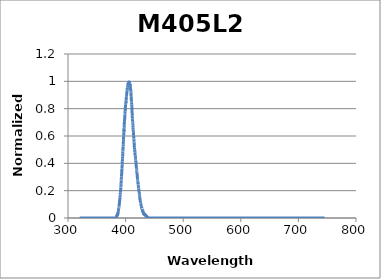
| Category | Normalized Intensity |
|---|---|
| 320.14817633 | 0 |
| 320.25686297 | 0 |
| 320.36555585 | 0 |
| 320.47425497 | 0 |
| 320.58296033 | 0 |
| 320.69167192 | 0 |
| 320.80038974 | 0 |
| 320.9091138 | 0 |
| 321.01784408 | 0 |
| 321.12658059 | 0 |
| 321.23532333 | 0 |
| 321.3440723 | 0 |
| 321.45282748 | 0 |
| 321.56158889 | 0 |
| 321.67035652 | 0 |
| 321.77913037 | 0 |
| 321.88791044 | 0 |
| 321.99669672 | 0 |
| 322.10548922 | 0 |
| 322.21428793 | 0 |
| 322.32309285 | 0 |
| 322.43190398 | 0 |
| 322.54072132 | 0 |
| 322.64954486 | 0 |
| 322.75837461 | 0 |
| 322.86721057 | 0 |
| 322.97605272 | 0 |
| 323.08490108 | 0 |
| 323.19375563 | 0 |
| 323.30261639 | 0 |
| 323.41148333 | 0 |
| 323.52035648 | 0 |
| 323.62923581 | 0 |
| 323.73812134 | 0 |
| 323.84701305 | 0 |
| 323.95591096 | 0 |
| 324.06481505 | 0 |
| 324.17372533 | 0 |
| 324.28264178 | 0 |
| 324.39156443 | 0 |
| 324.50049325 | 0 |
| 324.60942825 | 0 |
| 324.71836943 | 0 |
| 324.82731678 | 0 |
| 324.93627031 | 0 |
| 325.04523001 | 0 |
| 325.15419588 | 0 |
| 325.26316792 | 0 |
| 325.37214613 | 0 |
| 325.48113051 | 0 |
| 325.59012105 | 0 |
| 325.69911775 | 0 |
| 325.80812062 | 0 |
| 325.91712964 | 0 |
| 326.02614483 | 0 |
| 326.13516617 | 0 |
| 326.24419367 | 0 |
| 326.35322732 | 0 |
| 326.46226713 | 0 |
| 326.57131308 | 0 |
| 326.68036519 | 0 |
| 326.78942344 | 0 |
| 326.89848784 | 0 |
| 327.00755839 | 0 |
| 327.11663508 | 0 |
| 327.22571791 | 0 |
| 327.33480688 | 0 |
| 327.44390199 | 0 |
| 327.55300323 | 0 |
| 327.66211061 | 0 |
| 327.77122413 | 0 |
| 327.88034378 | 0 |
| 327.98946956 | 0 |
| 328.09860147 | 0 |
| 328.20773951 | 0 |
| 328.31688367 | 0 |
| 328.42603396 | 0 |
| 328.53519037 | 0 |
| 328.6443529 | 0 |
| 328.75352156 | 0 |
| 328.86269633 | 0 |
| 328.97187722 | 0 |
| 329.08106423 | 0 |
| 329.19025735 | 0 |
| 329.29945658 | 0 |
| 329.40866192 | 0 |
| 329.51787337 | 0 |
| 329.62709093 | 0 |
| 329.7363146 | 0 |
| 329.84554437 | 0 |
| 329.95478025 | 0 |
| 330.06402222 | 0 |
| 330.1732703 | 0 |
| 330.28252448 | 0 |
| 330.39178475 | 0 |
| 330.50105112 | 0 |
| 330.61032358 | 0 |
| 330.71960213 | 0 |
| 330.82888678 | 0 |
| 330.93817751 | 0 |
| 331.04747434 | 0 |
| 331.15677725 | 0 |
| 331.26608624 | 0 |
| 331.37540132 | 0 |
| 331.48472248 | 0 |
| 331.59404972 | 0 |
| 331.70338303 | 0 |
| 331.81272243 | 0 |
| 331.9220679 | 0 |
| 332.03141944 | 0 |
| 332.14077706 | 0 |
| 332.25014075 | 0 |
| 332.3595105 | 0 |
| 332.46888633 | 0 |
| 332.57826822 | 0 |
| 332.68765617 | 0 |
| 332.79705019 | 0 |
| 332.90645027 | 0 |
| 333.01585641 | 0 |
| 333.12526861 | 0 |
| 333.23468687 | 0 |
| 333.34411118 | 0 |
| 333.45354155 | 0 |
| 333.56297796 | 0 |
| 333.67242043 | 0 |
| 333.78186895 | 0 |
| 333.89132352 | 0 |
| 334.00078413 | 0 |
| 334.11025079 | 0 |
| 334.21972349 | 0 |
| 334.32920223 | 0 |
| 334.43868701 | 0 |
| 334.54817783 | 0 |
| 334.65767469 | 0 |
| 334.76717758 | 0 |
| 334.8766865 | 0 |
| 334.98620146 | 0 |
| 335.09572245 | 0 |
| 335.20524947 | 0 |
| 335.31478252 | 0 |
| 335.42432159 | 0 |
| 335.53386669 | 0 |
| 335.64341781 | 0 |
| 335.75297495 | 0 |
| 335.86253811 | 0 |
| 335.97210729 | 0 |
| 336.08168249 | 0 |
| 336.1912637 | 0 |
| 336.30085093 | 0 |
| 336.41044416 | 0 |
| 336.52004341 | 0 |
| 336.62964867 | 0 |
| 336.73925994 | 0 |
| 336.84887721 | 0 |
| 336.95850049 | 0 |
| 337.06812977 | 0 |
| 337.17776505 | 0 |
| 337.28740633 | 0 |
| 337.39705361 | 0 |
| 337.50670688 | 0 |
| 337.61636616 | 0 |
| 337.72603142 | 0 |
| 337.83570268 | 0 |
| 337.94537993 | 0 |
| 338.05506317 | 0 |
| 338.16475239 | 0 |
| 338.2744476 | 0 |
| 338.3841488 | 0 |
| 338.49385598 | 0 |
| 338.60356914 | 0 |
| 338.71328828 | 0 |
| 338.8230134 | 0 |
| 338.93274449 | 0 |
| 339.04248156 | 0 |
| 339.15222461 | 0 |
| 339.26197362 | 0 |
| 339.37172861 | 0 |
| 339.48148957 | 0 |
| 339.59125649 | 0 |
| 339.70102938 | 0 |
| 339.81080823 | 0 |
| 339.92059305 | 0 |
| 340.03038383 | 0 |
| 340.14018057 | 0 |
| 340.24998327 | 0 |
| 340.35979192 | 0 |
| 340.46960653 | 0 |
| 340.57942709 | 0 |
| 340.6892536 | 0 |
| 340.79908607 | 0 |
| 340.90892448 | 0 |
| 341.01876885 | 0 |
| 341.12861915 | 0 |
| 341.2384754 | 0 |
| 341.3483376 | 0 |
| 341.45820574 | 0 |
| 341.56807981 | 0 |
| 341.67795983 | 0 |
| 341.78784578 | 0 |
| 341.89773766 | 0 |
| 342.00763548 | 0 |
| 342.11753924 | 0 |
| 342.22744892 | 0 |
| 342.33736453 | 0 |
| 342.44728607 | 0 |
| 342.55721353 | 0 |
| 342.66714692 | 0 |
| 342.77708623 | 0 |
| 342.88703147 | 0 |
| 342.99698262 | 0 |
| 343.10693969 | 0 |
| 343.21690268 | 0 |
| 343.32687158 | 0 |
| 343.4368464 | 0 |
| 343.54682713 | 0 |
| 343.65681377 | 0 |
| 343.76680631 | 0 |
| 343.87680477 | 0 |
| 343.98680913 | 0 |
| 344.0968194 | 0 |
| 344.20683557 | 0 |
| 344.31685763 | 0 |
| 344.4268856 | 0 |
| 344.53691947 | 0 |
| 344.64695924 | 0 |
| 344.75700489 | 0 |
| 344.86705645 | 0 |
| 344.97711389 | 0 |
| 345.08717723 | 0 |
| 345.19724645 | 0 |
| 345.30732156 | 0 |
| 345.41740256 | 0 |
| 345.52748944 | 0 |
| 345.63758221 | 0 |
| 345.74768085 | 0 |
| 345.85778538 | 0 |
| 345.96789578 | 0 |
| 346.07801206 | 0 |
| 346.18813421 | 0 |
| 346.29826224 | 0 |
| 346.40839614 | 0 |
| 346.51853591 | 0 |
| 346.62868155 | 0 |
| 346.73883306 | 0 |
| 346.84899043 | 0 |
| 346.95915367 | 0 |
| 347.06932277 | 0 |
| 347.17949773 | 0 |
| 347.28967855 | 0 |
| 347.39986522 | 0 |
| 347.51005776 | 0 |
| 347.62025615 | 0 |
| 347.73046039 | 0 |
| 347.84067049 | 0 |
| 347.95088643 | 0 |
| 348.06110823 | 0 |
| 348.17133587 | 0 |
| 348.28156935 | 0 |
| 348.39180868 | 0 |
| 348.50205386 | 0 |
| 348.61230487 | 0 |
| 348.72256173 | 0 |
| 348.83282442 | 0 |
| 348.94309295 | 0 |
| 349.05336731 | 0 |
| 349.16364751 | 0 |
| 349.27393354 | 0 |
| 349.3842254 | 0 |
| 349.49452309 | 0 |
| 349.6048266 | 0 |
| 349.71513594 | 0 |
| 349.82545111 | 0 |
| 349.93577209 | 0 |
| 350.0460989 | 0 |
| 350.15643153 | 0 |
| 350.26676998 | 0 |
| 350.37711424 | 0 |
| 350.48746432 | 0 |
| 350.59782021 | 0 |
| 350.70818191 | 0 |
| 350.81854942 | 0 |
| 350.92892274 | 0 |
| 351.03930187 | 0 |
| 351.14968681 | 0 |
| 351.26007754 | 0 |
| 351.37047409 | 0 |
| 351.48087643 | 0 |
| 351.59128457 | 0 |
| 351.70169851 | 0 |
| 351.81211824 | 0 |
| 351.92254377 | 0 |
| 352.0329751 | 0 |
| 352.14341221 | 0 |
| 352.25385512 | 0 |
| 352.36430381 | 0 |
| 352.47475829 | 0 |
| 352.58521856 | 0 |
| 352.69568461 | 0 |
| 352.80615644 | 0 |
| 352.91663406 | 0 |
| 353.02711745 | 0 |
| 353.13760662 | 0 |
| 353.24810157 | 0 |
| 353.35860229 | 0 |
| 353.46910879 | 0 |
| 353.57962106 | 0 |
| 353.69013909 | 0 |
| 353.8006629 | 0 |
| 353.91119247 | 0 |
| 354.02172781 | 0 |
| 354.13226891 | 0 |
| 354.24281578 | 0 |
| 354.3533684 | 0 |
| 354.46392679 | 0 |
| 354.57449093 | 0 |
| 354.68506083 | 0 |
| 354.79563649 | 0 |
| 354.90621789 | 0 |
| 355.01680505 | 0 |
| 355.12739796 | 0 |
| 355.23799662 | 0 |
| 355.34860102 | 0 |
| 355.45921117 | 0 |
| 355.56982707 | 0 |
| 355.6804487 | 0 |
| 355.79107608 | 0 |
| 355.9017092 | 0 |
| 356.01234805 | 0 |
| 356.12299264 | 0 |
| 356.23364297 | 0 |
| 356.34429902 | 0 |
| 356.45496081 | 0 |
| 356.56562833 | 0 |
| 356.67630158 | 0 |
| 356.78698056 | 0 |
| 356.89766526 | 0 |
| 357.00835568 | 0 |
| 357.11905183 | 0 |
| 357.2297537 | 0 |
| 357.34046128 | 0 |
| 357.45117459 | 0 |
| 357.56189361 | 0 |
| 357.67261835 | 0 |
| 357.78334879 | 0 |
| 357.89408495 | 0 |
| 358.00482682 | 0 |
| 358.1155744 | 0 |
| 358.22632769 | 0 |
| 358.33708668 | 0 |
| 358.44785137 | 0 |
| 358.55862177 | 0 |
| 358.66939787 | 0 |
| 358.78017966 | 0 |
| 358.89096716 | 0 |
| 359.00176035 | 0 |
| 359.11255923 | 0 |
| 359.22336381 | 0 |
| 359.33417408 | 0 |
| 359.44499004 | 0 |
| 359.55581169 | 0 |
| 359.66663902 | 0 |
| 359.77747204 | 0 |
| 359.88831075 | 0 |
| 359.99915513 | 0 |
| 360.1100052 | 0 |
| 360.22086094 | 0 |
| 360.33172237 | 0 |
| 360.44258947 | 0 |
| 360.55346224 | 0 |
| 360.66434069 | 0 |
| 360.77522481 | 0 |
| 360.8861146 | 0 |
| 360.99701005 | 0 |
| 361.10791118 | 0 |
| 361.21881796 | 0 |
| 361.32973042 | 0 |
| 361.44064853 | 0 |
| 361.55157231 | 0 |
| 361.66250174 | 0 |
| 361.77343683 | 0 |
| 361.88437758 | 0 |
| 361.99532398 | 0 |
| 362.10627604 | 0 |
| 362.21723374 | 0 |
| 362.3281971 | 0 |
| 362.43916611 | 0 |
| 362.55014076 | 0 |
| 362.66112105 | 0 |
| 362.77210699 | 0 |
| 362.88309858 | 0 |
| 362.9940958 | 0 |
| 363.10509866 | 0 |
| 363.21610716 | 0 |
| 363.3271213 | 0 |
| 363.43814107 | 0 |
| 363.54916647 | 0 |
| 363.6601975 | 0 |
| 363.77123417 | 0 |
| 363.88227646 | 0 |
| 363.99332438 | 0 |
| 364.10437792 | 0 |
| 364.21543709 | 0 |
| 364.32650188 | 0 |
| 364.43757229 | 0 |
| 364.54864832 | 0 |
| 364.65972997 | 0 |
| 364.77081723 | 0 |
| 364.88191011 | 0 |
| 364.9930086 | 0 |
| 365.1041127 | 0 |
| 365.21522241 | 0 |
| 365.32633773 | 0 |
| 365.43745866 | 0 |
| 365.54858519 | 0 |
| 365.65971732 | 0 |
| 365.77085506 | 0 |
| 365.88199839 | 0 |
| 365.99314733 | 0 |
| 366.10430186 | 0 |
| 366.21546199 | 0 |
| 366.32662772 | 0 |
| 366.43779903 | 0 |
| 366.54897594 | 0 |
| 366.66015844 | 0 |
| 366.77134652 | 0 |
| 366.88254019 | 0 |
| 366.99373945 | 0 |
| 367.10494429 | 0 |
| 367.21615471 | 0 |
| 367.32737072 | 0 |
| 367.4385923 | 0 |
| 367.54981946 | 0 |
| 367.66105219 | 0 |
| 367.7722905 | 0 |
| 367.88353438 | 0 |
| 367.99478384 | 0 |
| 368.10603886 | 0 |
| 368.21729945 | 0 |
| 368.32856561 | 0 |
| 368.43983733 | 0 |
| 368.55111462 | 0 |
| 368.66239746 | 0 |
| 368.77368587 | 0 |
| 368.88497984 | 0 |
| 368.99627936 | 0 |
| 369.10758444 | 0 |
| 369.21889508 | 0 |
| 369.33021127 | 0 |
| 369.441533 | 0 |
| 369.55286029 | 0 |
| 369.66419313 | 0 |
| 369.77553151 | 0 |
| 369.88687544 | 0 |
| 369.99822491 | 0 |
| 370.10957992 | 0 |
| 370.22094047 | 0 |
| 370.33230656 | 0 |
| 370.44367819 | 0 |
| 370.55505536 | 0 |
| 370.66643806 | 0 |
| 370.77782629 | 0 |
| 370.88922005 | 0 |
| 371.00061934 | 0 |
| 371.11202416 | 0 |
| 371.22343451 | 0 |
| 371.33485038 | 0 |
| 371.44627178 | 0 |
| 371.55769869 | 0 |
| 371.66913113 | 0 |
| 371.78056908 | 0 |
| 371.89201256 | 0 |
| 372.00346155 | 0 |
| 372.11491605 | 0 |
| 372.22637606 | 0 |
| 372.33784159 | 0 |
| 372.44931262 | 0 |
| 372.56078917 | 0 |
| 372.67227122 | 0 |
| 372.78375877 | 0 |
| 372.89525183 | 0 |
| 373.00675039 | 0 |
| 373.11825445 | 0 |
| 373.22976401 | 0 |
| 373.34127907 | 0 |
| 373.45279962 | 0 |
| 373.56432566 | 0 |
| 373.6758572 | 0 |
| 373.78739423 | 0 |
| 373.89893675 | 0 |
| 374.01048476 | 0 |
| 374.12203825 | 0 |
| 374.23359723 | 0 |
| 374.34516169 | 0 |
| 374.45673163 | 0 |
| 374.56830705 | 0 |
| 374.67988796 | 0 |
| 374.79147433 | 0 |
| 374.90306619 | 0 |
| 375.01466352 | 0 |
| 375.12626632 | 0 |
| 375.23787459 | 0 |
| 375.34948833 | 0 |
| 375.46110754 | 0 |
| 375.57273221 | 0 |
| 375.68436235 | 0 |
| 375.79599796 | 0 |
| 375.90763902 | 0 |
| 376.01928555 | 0 |
| 376.13093753 | 0 |
| 376.24259497 | 0 |
| 376.35425787 | 0 |
| 376.46592622 | 0 |
| 376.57760002 | 0 |
| 376.68927927 | 0 |
| 376.80096397 | 0 |
| 376.91265413 | 0 |
| 377.02434972 | 0 |
| 377.13605076 | 0 |
| 377.24775725 | 0 |
| 377.35946917 | 0 |
| 377.47118654 | 0 |
| 377.58290935 | 0 |
| 377.69463759 | 0 |
| 377.80637126 | 0 |
| 377.91811038 | 0 |
| 378.02985492 | 0 |
| 378.14160489 | 0 |
| 378.2533603 | 0 |
| 378.36512113 | 0 |
| 378.47688739 | 0 |
| 378.58865907 | 0 |
| 378.70043617 | 0 |
| 378.8122187 | 0 |
| 378.92400665 | 0 |
| 379.03580001 | 0 |
| 379.1475988 | 0 |
| 379.25940299 | 0 |
| 379.37121261 | 0 |
| 379.48302763 | 0 |
| 379.59484806 | 0 |
| 379.70667391 | 0 |
| 379.81850516 | 0 |
| 379.93034182 | 0 |
| 380.04218388 | 0 |
| 380.15403135 | 0 |
| 380.26588421 | 0 |
| 380.37774248 | 0 |
| 380.48960615 | 0 |
| 380.60147521 | 0 |
| 380.71334967 | 0 |
| 380.82522952 | 0 |
| 380.93711476 | 0 |
| 381.0490054 | 0 |
| 381.16090142 | 0 |
| 381.27280283 | 0 |
| 381.38470963 | 0 |
| 381.49662181 | 0 |
| 381.60853938 | 0 |
| 381.72046232 | 0 |
| 381.83239065 | 0 |
| 381.94432436 | 0 |
| 382.05626344 | 0 |
| 382.16820789 | 0 |
| 382.28015772 | 0 |
| 382.39211293 | 0 |
| 382.5040735 | 0 |
| 382.61603944 | 0 |
| 382.72801076 | 0 |
| 382.83998743 | 0 |
| 382.95196947 | 0 |
| 383.06395688 | 0 |
| 383.17594964 | 0 |
| 383.28794777 | 0 |
| 383.39995125 | 0 |
| 383.51196009 | 0.003 |
| 383.62397429 | 0.002 |
| 383.73599384 | 0.003 |
| 383.84801874 | 0.002 |
| 383.96004899 | 0.003 |
| 384.07208459 | 0.004 |
| 384.18412554 | 0.006 |
| 384.29617184 | 0.006 |
| 384.40822348 | 0.007 |
| 384.52028046 | 0.009 |
| 384.63234278 | 0.013 |
| 384.74441044 | 0.011 |
| 384.85648345 | 0.014 |
| 384.96856178 | 0.018 |
| 385.08064546 | 0.022 |
| 385.19273447 | 0.018 |
| 385.30482881 | 0.022 |
| 385.41692848 | 0.023 |
| 385.52903347 | 0.021 |
| 385.6411438 | 0.025 |
| 385.75325945 | 0.021 |
| 385.86538043 | 0.025 |
| 385.97750673 | 0.026 |
| 386.08963835 | 0.022 |
| 386.20177529 | 0.024 |
| 386.31391755 | 0.026 |
| 386.42606513 | 0.034 |
| 386.53821802 | 0.028 |
| 386.65037622 | 0.036 |
| 386.76253974 | 0.044 |
| 386.87470857 | 0.046 |
| 386.9868827 | 0.046 |
| 387.09906215 | 0.046 |
| 387.2112469 | 0.044 |
| 387.32343695 | 0.051 |
| 387.43563231 | 0.05 |
| 387.54783297 | 0.056 |
| 387.66003892 | 0.057 |
| 387.77225018 | 0.066 |
| 387.88446673 | 0.066 |
| 387.99668858 | 0.071 |
| 388.10891572 | 0.07 |
| 388.22114815 | 0.076 |
| 388.33338588 | 0.076 |
| 388.44562889 | 0.084 |
| 388.55787719 | 0.084 |
| 388.67013078 | 0.089 |
| 388.78238965 | 0.091 |
| 388.8946538 | 0.097 |
| 389.00692323 | 0.101 |
| 389.11919795 | 0.106 |
| 389.23147794 | 0.108 |
| 389.34376321 | 0.111 |
| 389.45605375 | 0.115 |
| 389.56834957 | 0.122 |
| 389.68065066 | 0.126 |
| 389.79295702 | 0.128 |
| 389.90526865 | 0.135 |
| 390.01758554 | 0.139 |
| 390.1299077 | 0.144 |
| 390.24223513 | 0.151 |
| 390.35456782 | 0.152 |
| 390.46690577 | 0.161 |
| 390.57924898 | 0.163 |
| 390.69159745 | 0.17 |
| 390.80395117 | 0.172 |
| 390.91631015 | 0.182 |
| 391.02867438 | 0.187 |
| 391.14104387 | 0.193 |
| 391.2534186 | 0.196 |
| 391.36579858 | 0.204 |
| 391.47818382 | 0.211 |
| 391.59057429 | 0.222 |
| 391.70297001 | 0.224 |
| 391.81537098 | 0.232 |
| 391.92777718 | 0.239 |
| 392.04018863 | 0.242 |
| 392.15260531 | 0.254 |
| 392.26502723 | 0.264 |
| 392.37745438 | 0.272 |
| 392.48988677 | 0.275 |
| 392.60232439 | 0.282 |
| 392.71476724 | 0.297 |
| 392.82721532 | 0.295 |
| 392.93966862 | 0.304 |
| 393.05212715 | 0.313 |
| 393.16459091 | 0.326 |
| 393.27705989 | 0.332 |
| 393.38953408 | 0.34 |
| 393.5020135 | 0.35 |
| 393.61449814 | 0.359 |
| 393.72698799 | 0.362 |
| 393.83948306 | 0.373 |
| 393.95198334 | 0.38 |
| 394.06448883 | 0.394 |
| 394.17699954 | 0.398 |
| 394.28951545 | 0.414 |
| 394.40203657 | 0.418 |
| 394.51456289 | 0.431 |
| 394.62709442 | 0.433 |
| 394.73963116 | 0.448 |
| 394.85217309 | 0.451 |
| 394.96472022 | 0.47 |
| 395.07727255 | 0.475 |
| 395.18983008 | 0.487 |
| 395.3023928 | 0.492 |
| 395.41496071 | 0.502 |
| 395.52753382 | 0.499 |
| 395.64011212 | 0.52 |
| 395.7526956 | 0.523 |
| 395.86528427 | 0.525 |
| 395.97787813 | 0.537 |
| 396.09047717 | 0.548 |
| 396.2030814 | 0.562 |
| 396.3156908 | 0.57 |
| 396.42830539 | 0.577 |
| 396.54092515 | 0.596 |
| 396.65355009 | 0.596 |
| 396.76618021 | 0.603 |
| 396.87881549 | 0.604 |
| 396.99145595 | 0.624 |
| 397.10410158 | 0.63 |
| 397.21675238 | 0.645 |
| 397.32940834 | 0.639 |
| 397.44206947 | 0.657 |
| 397.55473577 | 0.663 |
| 397.66740723 | 0.675 |
| 397.78008384 | 0.681 |
| 397.89276562 | 0.7 |
| 398.00545256 | 0.697 |
| 398.11814465 | 0.709 |
| 398.23084189 | 0.715 |
| 398.34354429 | 0.723 |
| 398.45625184 | 0.731 |
| 398.56896455 | 0.743 |
| 398.6816824 | 0.74 |
| 398.79440539 | 0.757 |
| 398.90713353 | 0.767 |
| 399.01986682 | 0.777 |
| 399.13260525 | 0.781 |
| 399.24534882 | 0.781 |
| 399.35809753 | 0.793 |
| 399.47085137 | 0.791 |
| 399.58361036 | 0.804 |
| 399.69637448 | 0.812 |
| 399.80914373 | 0.812 |
| 399.92191811 | 0.819 |
| 400.03469762 | 0.826 |
| 400.14748226 | 0.829 |
| 400.26027203 | 0.839 |
| 400.37306692 | 0.842 |
| 400.48586694 | 0.84 |
| 400.59867208 | 0.849 |
| 400.71148234 | 0.848 |
| 400.82429772 | 0.858 |
| 400.93711822 | 0.864 |
| 401.04994383 | 0.871 |
| 401.16277456 | 0.878 |
| 401.2756104 | 0.887 |
| 401.38845136 | 0.887 |
| 401.50129742 | 0.887 |
| 401.61414859 | 0.894 |
| 401.72700487 | 0.898 |
| 401.83986625 | 0.906 |
| 401.95273274 | 0.91 |
| 402.06560433 | 0.913 |
| 402.17848102 | 0.919 |
| 402.29136281 | 0.921 |
| 402.4042497 | 0.925 |
| 402.51714169 | 0.927 |
| 402.63003876 | 0.933 |
| 402.74294094 | 0.933 |
| 402.8558482 | 0.936 |
| 402.96876055 | 0.948 |
| 403.08167799 | 0.945 |
| 403.19460052 | 0.946 |
| 403.30752814 | 0.954 |
| 403.42046083 | 0.954 |
| 403.53339861 | 0.958 |
| 403.64634147 | 0.964 |
| 403.75928941 | 0.966 |
| 403.87224243000003 | 0.963 |
| 403.98520053 | 0.964 |
| 404.09816369 | 0.967 |
| 404.21113193 | 0.971 |
| 404.32410525 | 0.984 |
| 404.43708363 | 0.979 |
| 404.55006708 | 0.973 |
| 404.6630556 | 0.98 |
| 404.77604918 | 0.984 |
| 404.88904783 | 0.984 |
| 405.00205154 | 0.983 |
| 405.11506031 | 0.995 |
| 405.22807414 | 0.985 |
| 405.34109302 | 0.99 |
| 405.45411697 | 0.999 |
| 405.56714596 | 0.999 |
| 405.68018001 | 1 |
| 405.79321911 | 0.992 |
| 405.90626326 | 0.994 |
| 406.01931246 | 0.996 |
| 406.13236671 | 0.994 |
| 406.245426 | 0.994 |
| 406.35849034 | 0.991 |
| 406.47155972 | 0.994 |
| 406.58463413 | 0.993 |
| 406.69771359 | 0.995 |
| 406.81079809 | 0.992 |
| 406.92388762 | 0.986 |
| 407.03698218 | 0.984 |
| 407.15008178 | 0.983 |
| 407.26318641 | 0.981 |
| 407.37629607 | 0.983 |
| 407.48941076 | 0.974 |
| 407.60253047 | 0.982 |
| 407.71565521 | 0.97 |
| 407.82878497 | 0.974 |
| 407.94191976 | 0.965 |
| 408.05505956 | 0.961 |
| 408.16820439 | 0.96 |
| 408.28135423 | 0.955 |
| 408.39450909 | 0.951 |
| 408.50766896 | 0.947 |
| 408.62083385 | 0.938 |
| 408.73400375 | 0.941 |
| 408.84717865 | 0.93 |
| 408.96035857 | 0.933 |
| 409.07354349 | 0.926 |
| 409.18673342 | 0.925 |
| 409.29992835 | 0.917 |
| 409.41312828 | 0.909 |
| 409.52633321 | 0.901 |
| 409.63954314 | 0.888 |
| 409.75275807 | 0.868 |
| 409.865978 | 0.87 |
| 409.97920292 | 0.865 |
| 410.09243283 | 0.867 |
| 410.20566773 | 0.856 |
| 410.31890763 | 0.855 |
| 410.43215251 | 0.843 |
| 410.54540238 | 0.832 |
| 410.65865723 | 0.828 |
| 410.77191707 | 0.818 |
| 410.88518189 | 0.811 |
| 410.99845169 | 0.799 |
| 411.11172647 | 0.789 |
| 411.22500622 | 0.783 |
| 411.33829095 | 0.768 |
| 411.45158066 | 0.76 |
| 411.56487534 | 0.747 |
| 411.67817499 | 0.746 |
| 411.79147961 | 0.73 |
| 411.9047892 | 0.727 |
| 412.01810375 | 0.721 |
| 412.13142327 | 0.718 |
| 412.24474775 | 0.705 |
| 412.3580772 | 0.701 |
| 412.4714116 | 0.696 |
| 412.58475097 | 0.692 |
| 412.69809529 | 0.678 |
| 412.81144456 | 0.674 |
| 412.9247988 | 0.662 |
| 413.03815798 | 0.652 |
| 413.15152212 | 0.648 |
| 413.2648912 | 0.641 |
| 413.37826523 | 0.631 |
| 413.49164421 | 0.629 |
| 413.60502814 | 0.621 |
| 413.71841701 | 0.621 |
| 413.83181082 | 0.604 |
| 413.94520957 | 0.599 |
| 414.05861326 | 0.586 |
| 414.17202188 | 0.582 |
| 414.28543545 | 0.578 |
| 414.39885394 | 0.574 |
| 414.51227737 | 0.562 |
| 414.62570573 | 0.553 |
| 414.73913902 | 0.551 |
| 414.85257724 | 0.546 |
| 414.96602038 | 0.537 |
| 415.07946845 | 0.531 |
| 415.19292145 | 0.522 |
| 415.30637936 | 0.516 |
| 415.4198422 | 0.513 |
| 415.53330995 | 0.504 |
| 415.64678262 | 0.505 |
| 415.76026021 | 0.5 |
| 415.87374271 | 0.486 |
| 415.98723012 | 0.484 |
| 416.10072245 | 0.487 |
| 416.21421968 | 0.48 |
| 416.32772182 | 0.472 |
| 416.44122887 | 0.468 |
| 416.55474082 | 0.457 |
| 416.66825768 | 0.458 |
| 416.78177944 | 0.452 |
| 416.8953061 | 0.45 |
| 417.00883765 | 0.446 |
| 417.12237411 | 0.442 |
| 417.23591546 | 0.437 |
| 417.3494617 | 0.426 |
| 417.46301284 | 0.421 |
| 417.57656887 | 0.42 |
| 417.69012979 | 0.409 |
| 417.80369559 | 0.412 |
| 417.91726628 | 0.409 |
| 418.03084186 | 0.403 |
| 418.14442232 | 0.395 |
| 418.25800766 | 0.391 |
| 418.37159788 | 0.388 |
| 418.48519298 | 0.383 |
| 418.59879296 | 0.377 |
| 418.71239782 | 0.37 |
| 418.82600754 | 0.364 |
| 418.93962214 | 0.365 |
| 419.05324161 | 0.355 |
| 419.16686595 | 0.354 |
| 419.28049516 | 0.346 |
| 419.39412924 | 0.342 |
| 419.50776818 | 0.339 |
| 419.62141198 | 0.339 |
| 419.73506064 | 0.331 |
| 419.84871417 | 0.324 |
| 419.96237255 | 0.32 |
| 420.07603579 | 0.319 |
| 420.18970389 | 0.312 |
| 420.30337684 | 0.308 |
| 420.41705464 | 0.299 |
| 420.53073729 | 0.294 |
| 420.6444248 | 0.288 |
| 420.75811715 | 0.291 |
| 420.87181434 | 0.28 |
| 420.98551638 | 0.28 |
| 421.09922327 | 0.273 |
| 421.212935 | 0.273 |
| 421.32665156 | 0.265 |
| 421.44037297 | 0.262 |
| 421.55409921 | 0.254 |
| 421.66783029 | 0.257 |
| 421.7815662 | 0.246 |
| 421.89530694 | 0.245 |
| 422.00905252 | 0.235 |
| 422.12280292 | 0.236 |
| 422.23655815 | 0.232 |
| 422.35031821 | 0.228 |
| 422.46408309 | 0.221 |
| 422.5778528 | 0.222 |
| 422.69162733 | 0.215 |
| 422.80540667 | 0.211 |
| 422.91919084 | 0.205 |
| 423.03297982 | 0.201 |
| 423.14677362 | 0.196 |
| 423.26057223 | 0.194 |
| 423.37437566 | 0.191 |
| 423.4881839 | 0.189 |
| 423.60199694 | 0.182 |
| 423.71581479 | 0.179 |
| 423.82963745 | 0.177 |
| 423.94346492 | 0.174 |
| 424.05729718 | 0.165 |
| 424.17113425 | 0.161 |
| 424.28497612 | 0.159 |
| 424.39882279 | 0.159 |
| 424.51267425 | 0.152 |
| 424.62653051 | 0.15 |
| 424.74039156 | 0.144 |
| 424.85425741 | 0.142 |
| 424.96812804 | 0.14 |
| 425.08200347 | 0.137 |
| 425.19588368 | 0.133 |
| 425.30976868 | 0.132 |
| 425.42365846 | 0.125 |
| 425.53755303 | 0.124 |
| 425.65145238 | 0.119 |
| 425.76535651 | 0.117 |
| 425.87926541 | 0.112 |
| 425.9931791 | 0.113 |
| 426.10709756 | 0.108 |
| 426.22102079 | 0.107 |
| 426.33494879 | 0.104 |
| 426.44888157 | 0.103 |
| 426.56281911 | 0.099 |
| 426.67676143 | 0.098 |
| 426.7907085 | 0.093 |
| 426.90466035 | 0.094 |
| 427.01861695 | 0.089 |
| 427.13257832 | 0.09 |
| 427.24654445 | 0.085 |
| 427.36051534 | 0.085 |
| 427.47449098 | 0.083 |
| 427.58847138 | 0.085 |
| 427.70245653 | 0.081 |
| 427.81644643 | 0.079 |
| 427.93044109 | 0.072 |
| 428.04444049 | 0.074 |
| 428.15844464 | 0.071 |
| 428.27245354 | 0.072 |
| 428.38646718 | 0.069 |
| 428.50048557 | 0.068 |
| 428.61450869 | 0.065 |
| 428.72853656 | 0.064 |
| 428.84256916 | 0.062 |
| 428.9566065 | 0.063 |
| 429.07064858 | 0.059 |
| 429.18469539 | 0.056 |
| 429.29874693 | 0.054 |
| 429.41280321 | 0.055 |
| 429.52686421 | 0.053 |
| 429.64092994 | 0.05 |
| 429.75500039 | 0.045 |
| 429.86907557 | 0.048 |
| 429.98315548 | 0.044 |
| 430.0972401 | 0.047 |
| 430.21132944 | 0.044 |
| 430.32542351 | 0.045 |
| 430.43952229 | 0.045 |
| 430.55362578 | 0.045 |
| 430.66773399 | 0.047 |
| 430.78184691 | 0.046 |
| 430.89596454 | 0.037 |
| 431.01008688 | 0.036 |
| 431.12421393 | 0.035 |
| 431.23834568 | 0.032 |
| 431.35248214 | 0.035 |
| 431.4666233 | 0.031 |
| 431.58076916 | 0.039 |
| 431.69491972 | 0.031 |
| 431.80907498 | 0.033 |
| 431.92323494 | 0.024 |
| 432.03739959 | 0.031 |
| 432.15156893 | 0.024 |
| 432.26574297 | 0.026 |
| 432.3799217 | 0.021 |
| 432.49410511 | 0.023 |
| 432.60829322 | 0.025 |
| 432.72248601 | 0.026 |
| 432.83668348 | 0.023 |
| 432.95088564 | 0.026 |
| 433.06509248 | 0.026 |
| 433.179304 | 0.022 |
| 433.29352019 | 0.025 |
| 433.40774107 | 0.022 |
| 433.52196661 | 0.024 |
| 433.63619684 | 0.021 |
| 433.75043173 | 0.024 |
| 433.86467129 | 0.021 |
| 433.97891553 | 0.024 |
| 434.09316443 | 0.021 |
| 434.20741799 | 0.024 |
| 434.32167622 | 0.023 |
| 434.43593912 | 0.022 |
| 434.55020667 | 0.021 |
| 434.66447889 | 0.02 |
| 434.77875576 | 0.021 |
| 434.89303729 | 0.017 |
| 435.00732347 | 0.018 |
| 435.12161431 | 0.018 |
| 435.2359098 | 0.017 |
| 435.35020994 | 0.013 |
| 435.46451473 | 0.018 |
| 435.57882416 | 0.013 |
| 435.69313824 | 0.013 |
| 435.80745697 | 0.013 |
| 435.92178034 | 0.013 |
| 436.03610835 | 0.012 |
| 436.150441 | 0.013 |
| 436.26477829 | 0.01 |
| 436.37912021 | 0.012 |
| 436.49346677 | 0.008 |
| 436.60781796 | 0.01 |
| 436.72217379 | 0.009 |
| 436.83653424 | 0.012 |
| 436.95089932 | 0.007 |
| 437.06526904 | 0.01 |
| 437.17964337 | 0.007 |
| 437.29402233 | 0.007 |
| 437.40840592 | 0.006 |
| 437.52279412 | 0.008 |
| 437.63718695 | 0.006 |
| 437.75158439 | 0.005 |
| 437.86598645 | 0.004 |
| 437.98039312 | 0.007 |
| 438.09480441 | 0.003 |
| 438.20922031 | 0.002 |
| 438.32364082 | 0.002 |
| 438.43806593 | 0.005 |
| 438.55249566 | 0.002 |
| 438.66692999 | 0.003 |
| 438.78136893 | 0 |
| 438.89581246 | 0.002 |
| 439.0102606 | 0 |
| 439.12471334 | 0.002 |
| 439.23917068 | 0 |
| 439.35363261 | 0.001 |
| 439.46809914 | 0 |
| 439.58257026 | 0.003 |
| 439.69704597 | 0 |
| 439.81152627 | 0 |
| 439.92601117 | 0 |
| 440.04050065 | 0 |
| 440.15499471 | 0 |
| 440.26949336 | 0 |
| 440.38399659 | 0 |
| 440.4985044 | 0 |
| 440.61301679 | 0 |
| 440.72753376 | 0 |
| 440.84205531 | 0 |
| 440.95658143 | 0 |
| 441.07111213 | 0 |
| 441.18564739 | 0 |
| 441.30018723 | 0 |
| 441.41473163 | 0 |
| 441.5292806 | 0 |
| 441.64383414 | 0 |
| 441.75839224 | 0 |
| 441.87295491 | 0 |
| 441.98752213 | 0 |
| 442.10209392 | 0 |
| 442.21667026 | 0 |
| 442.33125116 | 0 |
| 442.44583661 | 0 |
| 442.56042662 | 0 |
| 442.67502118 | 0 |
| 442.78962029 | 0 |
| 442.90422394 | 0 |
| 443.01883215 | 0 |
| 443.1334449 | 0 |
| 443.24806219 | 0 |
| 443.36268403 | 0 |
| 443.47731041 | 0 |
| 443.59194132 | 0 |
| 443.70657678 | 0 |
| 443.82121677 | 0 |
| 443.93586129 | 0 |
| 444.05051035 | 0 |
| 444.16516394 | 0 |
| 444.27982206 | 0 |
| 444.39448471 | 0 |
| 444.50915189 | 0 |
| 444.62382359 | 0 |
| 444.73849982 | 0 |
| 444.85318056 | 0 |
| 444.96786583 | 0 |
| 445.08255562 | 0 |
| 445.19724993 | 0 |
| 445.31194875 | 0 |
| 445.42665209 | 0 |
| 445.54135994 | 0 |
| 445.6560723 | 0 |
| 445.77078917 | 0 |
| 445.88551055 | 0 |
| 446.00023644 | 0 |
| 446.11496683 | 0 |
| 446.22970173 | 0 |
| 446.34444113 | 0 |
| 446.45918503 | 0 |
| 446.57393342 | 0 |
| 446.68868632 | 0 |
| 446.80344371 | 0 |
| 446.9182056 | 0 |
| 447.03297198 | 0 |
| 447.14774285 | 0 |
| 447.26251822 | 0 |
| 447.37729807 | 0 |
| 447.49208241 | 0 |
| 447.60687123 | 0 |
| 447.72166453 | 0 |
| 447.83646232 | 0 |
| 447.95126459 | 0 |
| 448.06607134 | 0 |
| 448.18088257 | 0 |
| 448.29569827 | 0 |
| 448.41051845 | 0 |
| 448.5253431 | 0 |
| 448.64017222 | 0 |
| 448.75500582 | 0 |
| 448.86984388 | 0 |
| 448.9846864 | 0 |
| 449.0995334 | 0 |
| 449.21438485 | 0 |
| 449.32924077 | 0 |
| 449.44410115 | 0 |
| 449.55896599 | 0 |
| 449.67383529 | 0 |
| 449.78870904 | 0 |
| 449.90358725 | 0 |
| 450.01846991 | 0 |
| 450.13335702 | 0 |
| 450.24824858 | 0 |
| 450.36314459 | 0 |
| 450.47804504 | 0 |
| 450.59294995 | 0 |
| 450.70785929 | 0 |
| 450.82277308 | 0 |
| 450.93769131 | 0 |
| 451.05261398 | 0 |
| 451.16754108 | 0 |
| 451.28247262 | 0 |
| 451.3974086 | 0 |
| 451.51234901 | 0 |
| 451.62729385 | 0 |
| 451.74224312 | 0 |
| 451.85719681 | 0 |
| 451.97215494 | 0 |
| 452.08711749 | 0 |
| 452.20208446 | 0 |
| 452.31705586 | 0 |
| 452.43203168 | 0 |
| 452.54701191 | 0 |
| 452.66199657 | 0 |
| 452.77698563 | 0 |
| 452.89197912 | 0 |
| 453.00697702 | 0 |
| 453.12197932 | 0 |
| 453.23698604 | 0 |
| 453.35199717 | 0 |
| 453.4670127 | 0 |
| 453.58203264 | 0 |
| 453.69705698 | 0 |
| 453.81208572 | 0 |
| 453.92711887 | 0 |
| 454.04215641 | 0 |
| 454.15719835 | 0 |
| 454.27224469 | 0 |
| 454.38729542 | 0 |
| 454.50235054 | 0 |
| 454.61741006 | 0 |
| 454.73247396 | 0 |
| 454.84754226 | 0 |
| 454.96261494 | 0 |
| 455.077692 | 0 |
| 455.19277345 | 0 |
| 455.30785928 | 0 |
| 455.42294949 | 0 |
| 455.53804408 | 0 |
| 455.65314305 | 0 |
| 455.76824639 | 0 |
| 455.88335411 | 0 |
| 455.9984662 | 0 |
| 456.11358267 | 0 |
| 456.2287035 | 0 |
| 456.3438287 | 0 |
| 456.45895826 | 0 |
| 456.5740922 | 0 |
| 456.68923049 | 0 |
| 456.80437315 | 0 |
| 456.91952017 | 0 |
| 457.03467154 | 0 |
| 457.14982728 | 0 |
| 457.26498737 | 0 |
| 457.38015181 | 0 |
| 457.49532061 | 0 |
| 457.61049375 | 0 |
| 457.72567125 | 0 |
| 457.8408531 | 0 |
| 457.95603929 | 0 |
| 458.07122983 | 0 |
| 458.18642471 | 0 |
| 458.30162393 | 0 |
| 458.41682749 | 0 |
| 458.5320354 | 0 |
| 458.64724764 | 0 |
| 458.76246421 | 0 |
| 458.87768512 | 0 |
| 458.99291036 | 0 |
| 459.10813994 | 0 |
| 459.22337384 | 0 |
| 459.33861207 | 0 |
| 459.45385463 | 0 |
| 459.56910151 | 0 |
| 459.68435272 | 0 |
| 459.79960824 | 0 |
| 459.91486809 | 0 |
| 460.03013226 | 0 |
| 460.14540074 | 0 |
| 460.26067354 | 0 |
| 460.37595066 | 0 |
| 460.49123209 | 0 |
| 460.60651782 | 0 |
| 460.72180787 | 0 |
| 460.83710223 | 0 |
| 460.95240089 | 0 |
| 461.06770386 | 0 |
| 461.18301113 | 0 |
| 461.2983227 | 0 |
| 461.41363857 | 0 |
| 461.52895874 | 0 |
| 461.64428321 | 0 |
| 461.75961198 | 0 |
| 461.87494503 | 0 |
| 461.99028239 | 0 |
| 462.10562403 | 0 |
| 462.22096996 | 0 |
| 462.33632018 | 0 |
| 462.45167468 | 0 |
| 462.56703348 | 0 |
| 462.68239655 | 0 |
| 462.79776391 | 0 |
| 462.91313554 | 0 |
| 463.02851146 | 0 |
| 463.14389165 | 0 |
| 463.25927612 | 0 |
| 463.37466486 | 0 |
| 463.49005787 | 0 |
| 463.60545516 | 0 |
| 463.72085671 | 0 |
| 463.83626254 | 0 |
| 463.95167263 | 0 |
| 464.06708698 | 0 |
| 464.1825056 | 0 |
| 464.29792848 | 0 |
| 464.41335562 | 0 |
| 464.52878702 | 0 |
| 464.64422267 | 0 |
| 464.75966258 | 0 |
| 464.87510675 | 0 |
| 464.99055516 | 0 |
| 465.10600783 | 0 |
| 465.22146475 | 0 |
| 465.33692591 | 0 |
| 465.45239133 | 0 |
| 465.56786098 | 0 |
| 465.68333488 | 0 |
| 465.79881303 | 0 |
| 465.91429541 | 0 |
| 466.02978203 | 0 |
| 466.14527288 | 0 |
| 466.26076798 | 0 |
| 466.3762673 | 0 |
| 466.49177086 | 0 |
| 466.60727865 | 0 |
| 466.72279067 | 0 |
| 466.83830692 | 0 |
| 466.9538274 | 0 |
| 467.06935209 | 0 |
| 467.18488102 | 0 |
| 467.30041416 | 0 |
| 467.41595152 | 0 |
| 467.53149311 | 0 |
| 467.6470389 | 0 |
| 467.76258892 | 0 |
| 467.87814315 | 0 |
| 467.99370159 | 0 |
| 468.10926424 | 0 |
| 468.2248311 | 0 |
| 468.34040217 | 0 |
| 468.45597745 | 0 |
| 468.57155693 | 0 |
| 468.68714061 | 0 |
| 468.80272849 | 0 |
| 468.91832058 | 0 |
| 469.03391686 | 0 |
| 469.14951734 | 0 |
| 469.26512202 | 0 |
| 469.38073089 | 0 |
| 469.49634395 | 0 |
| 469.6119612 | 0 |
| 469.72758264 | 0 |
| 469.84320827 | 0 |
| 469.95883809 | 0 |
| 470.07447209 | 0 |
| 470.19011027 | 0 |
| 470.30575264 | 0 |
| 470.42139918 | 0 |
| 470.53704991 | 0 |
| 470.65270481 | 0 |
| 470.76836388 | 0 |
| 470.88402713 | 0 |
| 470.99969455 | 0 |
| 471.11536615 | 0 |
| 471.23104191 | 0 |
| 471.34672184 | 0 |
| 471.46240593 | 0 |
| 471.5780942 | 0 |
| 471.69378662 | 0 |
| 471.8094832 | 0 |
| 471.92518395 | 0 |
| 472.04088885 | 0 |
| 472.15659791 | 0 |
| 472.27231113 | 0 |
| 472.3880285 | 0 |
| 472.50375002 | 0 |
| 472.61947569 | 0 |
| 472.73520551 | 0 |
| 472.85093948 | 0 |
| 472.9666776 | 0 |
| 473.08241986 | 0 |
| 473.19816626 | 0 |
| 473.3139168 | 0 |
| 473.42967149 | 0 |
| 473.54543031 | 0 |
| 473.66119327 | 0 |
| 473.77696036 | 0 |
| 473.89273159 | 0 |
| 474.00850695 | 0 |
| 474.12428644 | 0 |
| 474.24007006 | 0 |
| 474.35585781 | 0 |
| 474.47164969 | 0 |
| 474.58744568 | 0 |
| 474.70324581 | 0 |
| 474.81905005 | 0 |
| 474.93485841 | 0 |
| 475.05067089 | 0 |
| 475.16648749 | 0 |
| 475.2823082 | 0 |
| 475.39813303 | 0 |
| 475.51396197 | 0 |
| 475.62979502 | 0 |
| 475.74563218 | 0 |
| 475.86147344 | 0 |
| 475.97731881 | 0 |
| 476.09316829 | 0 |
| 476.20902187 | 0 |
| 476.32487955 | 0 |
| 476.44074133 | 0 |
| 476.55660721 | 0 |
| 476.67247718 | 0 |
| 476.78835125 | 0 |
| 476.90422942 | 0 |
| 477.02011167 | 0 |
| 477.13599802 | 0 |
| 477.25188846 | 0 |
| 477.36778298 | 0 |
| 477.48368159 | 0 |
| 477.59958428 | 0 |
| 477.71549106 | 0 |
| 477.83140192 | 0 |
| 477.94731686 | 0 |
| 478.06323587 | 0 |
| 478.17915896 | 0 |
| 478.29508613 | 0 |
| 478.41101737 | 0 |
| 478.52695269 | 0 |
| 478.64289207 | 0 |
| 478.75883552 | 0 |
| 478.87478304 | 0 |
| 478.99073463 | 0 |
| 479.10669028 | 0 |
| 479.22264999 | 0 |
| 479.33861377 | 0 |
| 479.4545816 | 0 |
| 479.57055349 | 0 |
| 479.68652944 | 0 |
| 479.80250945 | 0 |
| 479.9184935 | 0 |
| 480.03448161 | 0 |
| 480.15047377 | 0 |
| 480.26646998 | 0 |
| 480.38247024 | 0 |
| 480.49847454 | 0 |
| 480.61448289 | 0 |
| 480.73049528 | 0 |
| 480.84651171 | 0 |
| 480.96253218 | 0 |
| 481.07855669 | 0 |
| 481.19458523 | 0 |
| 481.31061781 | 0 |
| 481.42665442 | 0 |
| 481.54269507 | 0 |
| 481.65873974 | 0 |
| 481.77478845 | 0 |
| 481.89084118 | 0 |
| 482.00689794 | 0 |
| 482.12295872 | 0 |
| 482.23902352 | 0 |
| 482.35509235 | 0 |
| 482.4711652 | 0 |
| 482.58724206 | 0 |
| 482.70332294 | 0 |
| 482.81940783 | 0 |
| 482.93549674 | 0 |
| 483.05158966 | 0 |
| 483.16768659 | 0 |
| 483.28378753 | 0 |
| 483.39989248 | 0 |
| 483.51600143 | 0 |
| 483.63211439 | 0 |
| 483.74823135 | 0 |
| 483.86435231 | 0 |
| 483.98047727 | 0 |
| 484.09660622 | 0 |
| 484.21273918 | 0 |
| 484.32887613 | 0 |
| 484.44501707 | 0 |
| 484.56116201 | 0 |
| 484.67731093 | 0 |
| 484.79346384 | 0 |
| 484.90962075 | 0 |
| 485.02578163 | 0 |
| 485.1419465 | 0 |
| 485.25811536 | 0 |
| 485.37428819 | 0 |
| 485.490465 | 0 |
| 485.6066458 | 0 |
| 485.72283056 | 0 |
| 485.83901931 | 0 |
| 485.95521202 | 0 |
| 486.07140871 | 0 |
| 486.18760937 | 0 |
| 486.303814 | 0 |
| 486.42002259 | 0 |
| 486.53623515 | 0 |
| 486.65245168 | 0 |
| 486.76867216 | 0 |
| 486.88489661 | 0 |
| 487.00112502 | 0 |
| 487.11735738 | 0 |
| 487.2335937 | 0 |
| 487.34983398 | 0 |
| 487.46607821 | 0 |
| 487.58232639 | 0 |
| 487.69857852 | 0 |
| 487.8148346 | 0 |
| 487.93109463 | 0 |
| 488.0473586 | 0 |
| 488.16362652 | 0 |
| 488.27989838 | 0 |
| 488.39617418 | 0 |
| 488.51245392 | 0 |
| 488.6287376 | 0 |
| 488.74502521 | 0 |
| 488.86131676 | 0 |
| 488.97761224 | 0 |
| 489.09391165 | 0 |
| 489.210215 | 0 |
| 489.32652227 | 0 |
| 489.44283347 | 0 |
| 489.55914859 | 0 |
| 489.67546764 | 0 |
| 489.79179062 | 0 |
| 489.90811751 | 0 |
| 490.02444832 | 0 |
| 490.14078305 | 0 |
| 490.25712169 | 0 |
| 490.37346426 | 0 |
| 490.48981073 | 0 |
| 490.60616111 | 0 |
| 490.72251541 | 0 |
| 490.83887361 | 0 |
| 490.95523573 | 0 |
| 491.07160174 | 0 |
| 491.18797166 | 0 |
| 491.30434549 | 0 |
| 491.42072321 | 0 |
| 491.53710483 | 0 |
| 491.65349035 | 0 |
| 491.76987977 | 0 |
| 491.88627308 | 0 |
| 492.00267029 | 0 |
| 492.11907138 | 0 |
| 492.23547637 | 0 |
| 492.35188524 | 0 |
| 492.46829801 | 0 |
| 492.58471465 | 0 |
| 492.70113519 | 0 |
| 492.8175596 | 0 |
| 492.93398789 | 0 |
| 493.05042007 | 0 |
| 493.16685612 | 0 |
| 493.28329605 | 0 |
| 493.39973985 | 0 |
| 493.51618752 | 0 |
| 493.63263907 | 0 |
| 493.74909449 | 0 |
| 493.86555377 | 0 |
| 493.98201693 | 0 |
| 494.09848394 | 0 |
| 494.21495482 | 0 |
| 494.33142957 | 0 |
| 494.44790817 | 0 |
| 494.56439064 | 0 |
| 494.68087696 | 0 |
| 494.79736714 | 0 |
| 494.91386117 | 0 |
| 495.03035905 | 0 |
| 495.14686079 | 0 |
| 495.26336638 | 0 |
| 495.37987581 | 0 |
| 495.49638909 | 0 |
| 495.61290622 | 0 |
| 495.72942719 | 0 |
| 495.845952 | 0 |
| 495.96248066 | 0 |
| 496.07901315 | 0 |
| 496.19554948 | 0 |
| 496.31208965 | 0 |
| 496.42863365 | 0 |
| 496.54518149 | 0 |
| 496.66173315 | 0 |
| 496.77828865 | 0 |
| 496.89484797 | 0 |
| 497.01141112 | 0 |
| 497.1279781 | 0 |
| 497.2445489 | 0 |
| 497.36112352 | 0 |
| 497.47770196 | 0 |
| 497.59428422 | 0 |
| 497.7108703 | 0 |
| 497.8274602 | 0 |
| 497.94405391 | 0 |
| 498.06065143 | 0 |
| 498.17725277 | 0 |
| 498.29385791 | 0 |
| 498.41046686 | 0 |
| 498.52707962 | 0 |
| 498.64369619 | 0 |
| 498.76031656 | 0 |
| 498.87694073 | 0 |
| 498.9935687 | 0 |
| 499.11020047 | 0 |
| 499.22683603 | 0 |
| 499.3434754 | 0 |
| 499.46011856 | 0 |
| 499.57676551 | 0 |
| 499.69341625 | 0 |
| 499.81007078 | 0 |
| 499.9267291 | 0 |
| 500.04339121 | 0 |
| 500.1600571 | 0 |
| 500.27672677 | 0 |
| 500.39340023 | 0 |
| 500.51007747 | 0 |
| 500.62675849 | 0 |
| 500.74344328 | 0 |
| 500.86013185 | 0 |
| 500.9768242 | 0 |
| 501.09352032 | 0 |
| 501.21022021 | 0 |
| 501.32692387 | 0 |
| 501.44363129 | 0 |
| 501.56034249 | 0 |
| 501.67705745 | 0 |
| 501.79377617 | 0 |
| 501.91049865 | 0 |
| 502.0272249 | 0 |
| 502.1439549 | 0 |
| 502.26068866 | 0 |
| 502.37742618 | 0 |
| 502.49416745 | 0 |
| 502.61091248 | 0 |
| 502.72766125 | 0 |
| 502.84441378 | 0 |
| 502.96117005 | 0 |
| 503.07793007 | 0 |
| 503.19469384 | 0 |
| 503.31146135 | 0 |
| 503.4282326 | 0 |
| 503.54500759 | 0 |
| 503.66178632 | 0 |
| 503.77856879 | 0 |
| 503.89535499 | 0 |
| 504.01214493 | 0 |
| 504.1289386 | 0 |
| 504.245736 | 0 |
| 504.36253713 | 0 |
| 504.47934199 | 0 |
| 504.59615058 | 0 |
| 504.71296289 | 0 |
| 504.82977892 | 0 |
| 504.94659868 | 0 |
| 505.06342216 | 0 |
| 505.18024935 | 0 |
| 505.29708027 | 0 |
| 505.41391489 | 0 |
| 505.53075324 | 0 |
| 505.64759529 | 0 |
| 505.76444106 | 0 |
| 505.88129054 | 0 |
| 505.99814372 | 0 |
| 506.11500061 | 0 |
| 506.23186121 | 0 |
| 506.34872551 | 0 |
| 506.46559351 | 0 |
| 506.58246521 | 0 |
| 506.69934061 | 0 |
| 506.81621971 | 0 |
| 506.9331025 | 0 |
| 507.04998899 | 0 |
| 507.16687917 | 0 |
| 507.28377304 | 0 |
| 507.4006706 | 0 |
| 507.51757185 | 0 |
| 507.63447679 | 0 |
| 507.75138541 | 0 |
| 507.86829771 | 0 |
| 507.9852137 | 0 |
| 508.10213336 | 0 |
| 508.21905671 | 0 |
| 508.33598373 | 0 |
| 508.45291443 | 0 |
| 508.5698488 | 0 |
| 508.68678684 | 0 |
| 508.80372856 | 0 |
| 508.92067394 | 0 |
| 509.037623 | 0 |
| 509.15457572 | 0 |
| 509.2715321 | 0 |
| 509.38849215 | 0 |
| 509.50545586 | 0 |
| 509.62242323 | 0 |
| 509.73939426 | 0 |
| 509.85636894 | 0 |
| 509.97334728 | 0 |
| 510.09032928 | 0 |
| 510.20731492 | 0 |
| 510.32430422 | 0 |
| 510.44129717 | 0 |
| 510.55829377 | 0 |
| 510.67529401 | 0 |
| 510.7922979 | 0 |
| 510.90930543 | 0 |
| 511.0263166 | 0 |
| 511.14333141 | 0 |
| 511.26034986 | 0 |
| 511.37737195 | 0 |
| 511.49439768 | 0 |
| 511.61142703 | 0 |
| 511.72846002 | 0 |
| 511.84549664 | 0 |
| 511.9625369 | 0 |
| 512.07958077 | 0 |
| 512.19662828 | 0 |
| 512.31367941 | 0 |
| 512.43073416 | 0 |
| 512.54779254 | 0 |
| 512.66485453 | 0 |
| 512.78192014 | 0 |
| 512.89898937 | 0 |
| 513.01606222 | 0 |
| 513.13313868 | 0 |
| 513.25021875 | 0 |
| 513.36730244 | 0 |
| 513.48438973 | 0 |
| 513.60148063 | 0 |
| 513.71857514 | 0 |
| 513.83567325 | 0 |
| 513.95277496 | 0 |
| 514.06988028 | 0 |
| 514.18698919 | 0 |
| 514.30410171 | 0 |
| 514.42121782 | 0 |
| 514.53833753 | 0 |
| 514.65546083 | 0 |
| 514.77258772 | 0 |
| 514.88971821 | 0 |
| 515.00685228 | 0 |
| 515.12398994 | 0 |
| 515.24113119 | 0 |
| 515.35827602 | 0 |
| 515.47542444 | 0 |
| 515.59257644 | 0 |
| 515.70973201 | 0 |
| 515.82689117 | 0 |
| 515.9440539 | 0 |
| 516.06122021 | 0 |
| 516.17839009 | 0 |
| 516.29556355 | 0 |
| 516.41274057 | 0 |
| 516.52992117 | 0 |
| 516.64710533 | 0 |
| 516.76429306 | 0 |
| 516.88148435 | 0 |
| 516.99867921 | 0 |
| 517.11587762 | 0 |
| 517.2330796 | 0 |
| 517.35028514 | 0 |
| 517.46749423 | 0 |
| 517.58470688 | 0 |
| 517.70192308 | 0 |
| 517.81914284 | 0 |
| 517.93636614 | 0 |
| 518.053593 | 0 |
| 518.1708234 | 0 |
| 518.28805735 | 0 |
| 518.40529484 | 0 |
| 518.52253587 | 0 |
| 518.63978045 | 0 |
| 518.75702857 | 0 |
| 518.87428022 | 0 |
| 518.99153542 | 0 |
| 519.10879414 | 0 |
| 519.22605641 | 0 |
| 519.3433222 | 0 |
| 519.46059152 | 0 |
| 519.57786438 | 0 |
| 519.69514076 | 0 |
| 519.81242067 | 0 |
| 519.9297041 | 0 |
| 520.04699105 | 0 |
| 520.16428153 | 0 |
| 520.28157553 | 0 |
| 520.39887304 | 0 |
| 520.51617407 | 0 |
| 520.63347862 | 0 |
| 520.75078668 | 0 |
| 520.86809825 | 0 |
| 520.98541334 | 0 |
| 521.10273193 | 0 |
| 521.22005403 | 0 |
| 521.33737963 | 0 |
| 521.45470874 | 0 |
| 521.57204136 | 0 |
| 521.68937747 | 0 |
| 521.80671709 | 0 |
| 521.9240602 | 0 |
| 522.04140681 | 0 |
| 522.15875691 | 0 |
| 522.27611051 | 0 |
| 522.3934676 | 0 |
| 522.51082819 | 0 |
| 522.62819226 | 0 |
| 522.74555981 | 0 |
| 522.86293086 | 0 |
| 522.98030539 | 0 |
| 523.0976834 | 0 |
| 523.21506489 | 0 |
| 523.33244986 | 0 |
| 523.44983831 | 0 |
| 523.56723024 | 0 |
| 523.68462564 | 0 |
| 523.80202452 | 0 |
| 523.91942687 | 0 |
| 524.03683269 | 0 |
| 524.15424197 | 0 |
| 524.27165473 | 0 |
| 524.38907095 | 0 |
| 524.50649064 | 0 |
| 524.62391378 | 0 |
| 524.74134039 | 0 |
| 524.85877046 | 0 |
| 524.97620399 | 0 |
| 525.09364097 | 0 |
| 525.21108141 | 0 |
| 525.32852531 | 0 |
| 525.44597265 | 0 |
| 525.56342345 | 0 |
| 525.68087769 | 0 |
| 525.79833538 | 0 |
| 525.91579652 | 0 |
| 526.0332611 | 0 |
| 526.15072913 | 0 |
| 526.26820059 | 0 |
| 526.3856755 | 0 |
| 526.50315384 | 0 |
| 526.62063562 | 0 |
| 526.73812084 | 0 |
| 526.85560949 | 0 |
| 526.97310157 | 0 |
| 527.09059708 | 0 |
| 527.20809602 | 0 |
| 527.32559839 | 0 |
| 527.44310418 | 0 |
| 527.5606134 | 0 |
| 527.67812604 | 0 |
| 527.7956421 | 0 |
| 527.91316159 | 0 |
| 528.03068449 | 0 |
| 528.1482108 | 0 |
| 528.26574053 | 0 |
| 528.38327368 | 0 |
| 528.50081023 | 0 |
| 528.6183502 | 0 |
| 528.73589358 | 0 |
| 528.85344036 | 0 |
| 528.97099055 | 0 |
| 529.08854414 | 0 |
| 529.20610114 | 0 |
| 529.32366154 | 0 |
| 529.44122533 | 0 |
| 529.55879253 | 0 |
| 529.67636312 | 0 |
| 529.7939371 | 0 |
| 529.91151448 | 0 |
| 530.02909526 | 0 |
| 530.14667942 | 0 |
| 530.26426697 | 0 |
| 530.38185791 | 0 |
| 530.49945223 | 0 |
| 530.61704994 | 0 |
| 530.73465103 | 0 |
| 530.8522555 | 0 |
| 530.96986335 | 0 |
| 531.08747458 | 0 |
| 531.20508919 | 0 |
| 531.32270717 | 0 |
| 531.44032852 | 0 |
| 531.55795325 | 0 |
| 531.67558134 | 0 |
| 531.79321281 | 0 |
| 531.91084764 | 0 |
| 532.02848584 | 0 |
| 532.1461274 | 0 |
| 532.26377232 | 0 |
| 532.38142061 | 0 |
| 532.49907225 | 0 |
| 532.61672725 | 0 |
| 532.73438561 | 0 |
| 532.85204733 | 0 |
| 532.9697124 | 0 |
| 533.08738082 | 0 |
| 533.20505258 | 0 |
| 533.3227277 | 0 |
| 533.44040617 | 0 |
| 533.55808798 | 0 |
| 533.67577313 | 0 |
| 533.79346163 | 0 |
| 533.91115347 | 0 |
| 534.02884865 | 0 |
| 534.14654716 | 0 |
| 534.26424902 | 0 |
| 534.3819542 | 0 |
| 534.49966272 | 0 |
| 534.61737458 | 0 |
| 534.73508976 | 0 |
| 534.85280827 | 0 |
| 534.97053011 | 0 |
| 535.08825527 | 0 |
| 535.20598376 | 0 |
| 535.32371557 | 0 |
| 535.4414507 | 0 |
| 535.55918915 | 0 |
| 535.67693092 | 0 |
| 535.794676 | 0 |
| 535.9124244 | 0 |
| 536.03017612 | 0 |
| 536.14793114 | 0 |
| 536.26568948 | 0 |
| 536.38345112 | 0 |
| 536.50121607 | 0 |
| 536.61898432 | 0 |
| 536.73675588 | 0 |
| 536.85453075 | 0 |
| 536.97230891 | 0 |
| 537.09009037 | 0 |
| 537.20787513 | 0 |
| 537.32566319 | 0 |
| 537.44345454 | 0 |
| 537.56124918 | 0 |
| 537.67904712 | 0 |
| 537.79684835 | 0 |
| 537.91465286 | 0 |
| 538.03246066 | 0 |
| 538.15027175 | 0 |
| 538.26808612 | 0 |
| 538.38590377 | 0 |
| 538.50372471 | 0 |
| 538.62154892 | 0 |
| 538.73937641 | 0 |
| 538.85720718 | 0 |
| 538.97504122 | 0 |
| 539.09287854 | 0 |
| 539.21071912 | 0 |
| 539.32856298 | 0 |
| 539.44641011 | 0 |
| 539.5642605 | 0 |
| 539.68211416 | 0 |
| 539.79997108 | 0 |
| 539.91783126 | 0 |
| 540.03569471 | 0 |
| 540.15356141 | 0 |
| 540.27143137 | 0 |
| 540.38930459 | 0 |
| 540.50718106 | 0 |
| 540.62506079 | 0 |
| 540.74294377 | 0 |
| 540.86082999 | 0 |
| 540.97871947 | 0 |
| 541.09661219 | 0 |
| 541.21450816 | 0 |
| 541.33240737 | 0 |
| 541.45030983 | 0 |
| 541.56821552 | 0 |
| 541.68612445 | 0 |
| 541.80403663 | 0 |
| 541.92195203 | 0 |
| 542.03987068 | 0 |
| 542.15779255 | 0 |
| 542.27571766 | 0 |
| 542.393646 | 0 |
| 542.51157756 | 0 |
| 542.62951235 | 0 |
| 542.74745037 | 0 |
| 542.86539161 | 0 |
| 542.98333607 | 0 |
| 543.10128376 | 0 |
| 543.21923466 | 0 |
| 543.33718878 | 0 |
| 543.45514612 | 0 |
| 543.57310667 | 0 |
| 543.69107044 | 0 |
| 543.80903741 | 0 |
| 543.9270076 | 0 |
| 544.04498099 | 0 |
| 544.16295759 | 0 |
| 544.2809374 | 0 |
| 544.39892041 | 0 |
| 544.51690662 | 0 |
| 544.63489603 | 0 |
| 544.75288864 | 0 |
| 544.87088445 | 0 |
| 544.98888346 | 0 |
| 545.10688566 | 0 |
| 545.22489105 | 0 |
| 545.34289964 | 0 |
| 545.46091141 | 0 |
| 545.57892637 | 0 |
| 545.69694452 | 0 |
| 545.81496586 | 0 |
| 545.93299037 | 0 |
| 546.05101807 | 0 |
| 546.16904895 | 0 |
| 546.28708301 | 0 |
| 546.40512025 | 0 |
| 546.52316067 | 0 |
| 546.64120425 | 0 |
| 546.75925101 | 0 |
| 546.87730095 | 0 |
| 546.99535405 | 0 |
| 547.11341032 | 0 |
| 547.23146975 | 0 |
| 547.34953236 | 0 |
| 547.46759812 | 0 |
| 547.58566705 | 0 |
| 547.70373914 | 0 |
| 547.82181438 | 0 |
| 547.93989279 | 0 |
| 548.05797435 | 0 |
| 548.17605906 | 0 |
| 548.29414693 | 0 |
| 548.41223795 | 0 |
| 548.53033212 | 0 |
| 548.64842943 | 0 |
| 548.7665299 | 0 |
| 548.88463351 | 0 |
| 549.00274026 | 0 |
| 549.12085015 | 0 |
| 549.23896319 | 0 |
| 549.35707936 | 0 |
| 549.47519867 | 0 |
| 549.59332112 | 0 |
| 549.7114467 | 0 |
| 549.82957541 | 0 |
| 549.94770726 | 0 |
| 550.06584224 | 0 |
| 550.18398034 | 0 |
| 550.30212157 | 0 |
| 550.42026592 | 0 |
| 550.5384134 | 0 |
| 550.656564 | 0 |
| 550.77471772 | 0 |
| 550.89287456 | 0 |
| 551.01103452 | 0 |
| 551.12919759 | 0 |
| 551.24736378 | 0 |
| 551.36553308 | 0 |
| 551.48370549 | 0 |
| 551.60188101 | 0 |
| 551.72005964 | 0 |
| 551.83824137 | 0 |
| 551.95642621 | 0 |
| 552.07461416 | 0 |
| 552.1928052 | 0 |
| 552.31099935 | 0 |
| 552.42919659 | 0 |
| 552.54739694 | 0 |
| 552.66560038 | 0 |
| 552.78380691 | 0 |
| 552.90201653 | 0 |
| 553.02022925 | 0 |
| 553.13844505 | 0 |
| 553.25666395 | 0 |
| 553.37488593 | 0 |
| 553.49311099 | 0 |
| 553.61133914 | 0 |
| 553.72957037 | 0 |
| 553.84780468 | 0 |
| 553.96604207 | 0 |
| 554.08428254 | 0 |
| 554.20252608 | 0 |
| 554.3207727 | 0 |
| 554.43902239 | 0 |
| 554.55727515 | 0 |
| 554.67553098 | 0 |
| 554.79378988 | 0 |
| 554.91205184 | 0 |
| 555.03031687 | 0 |
| 555.14858496 | 0 |
| 555.26685612 | 0 |
| 555.38513033 | 0 |
| 555.50340761 | 0 |
| 555.62168794 | 0 |
| 555.73997132 | 0 |
| 555.85825777 | 0 |
| 555.97654726 | 0 |
| 556.0948398 | 0 |
| 556.2131354 | 0 |
| 556.33143404 | 0 |
| 556.44973573 | 0 |
| 556.56804046 | 0 |
| 556.68634824 | 0 |
| 556.80465905 | 0 |
| 556.92297291 | 0 |
| 557.04128981 | 0 |
| 557.15960974 | 0 |
| 557.27793271 | 0 |
| 557.39625872 | 0 |
| 557.51458775 | 0 |
| 557.63291982 | 0 |
| 557.75125492 | 0 |
| 557.86959304 | 0 |
| 557.98793419 | 0 |
| 558.10627837 | 0 |
| 558.22462557 | 0 |
| 558.34297579 | 0 |
| 558.46132903 | 0 |
| 558.57968529 | 0 |
| 558.69804457 | 0 |
| 558.81640686 | 0 |
| 558.93477217 | 0 |
| 559.05314049 | 0 |
| 559.17151182 | 0 |
| 559.28988615 | 0 |
| 559.4082635 | 0 |
| 559.52664386 | 0 |
| 559.64502721 | 0 |
| 559.76341358 | 0 |
| 559.88180294 | 0 |
| 560.0001953 | 0 |
| 560.11859066 | 0 |
| 560.23698902 | 0 |
| 560.35539038 | 0 |
| 560.47379472 | 0 |
| 560.59220207 | 0 |
| 560.7106124 | 0 |
| 560.82902572 | 0 |
| 560.94744203 | 0 |
| 561.06586132 | 0 |
| 561.1842836 | 0 |
| 561.30270887 | 0 |
| 561.42113711 | 0 |
| 561.53956833 | 0 |
| 561.65800254 | 0 |
| 561.77643972 | 0 |
| 561.89487987 | 0 |
| 562.013323 | 0 |
| 562.13176911 | 0 |
| 562.25021818 | 0 |
| 562.36867022 | 0 |
| 562.48712523 | 0 |
| 562.60558321 | 0 |
| 562.72404415 | 0 |
| 562.84250805 | 0 |
| 562.96097492 | 0 |
| 563.07944474 | 0 |
| 563.19791753 | 0 |
| 563.31639327 | 0 |
| 563.43487196 | 0 |
| 563.55335361 | 0 |
| 563.67183822 | 0 |
| 563.79032577 | 0 |
| 563.90881627 | 0 |
| 564.02730972 | 0 |
| 564.14580612 | 0 |
| 564.26430546 | 0 |
| 564.38280774 | 0 |
| 564.50131297 | 0 |
| 564.61982114 | 0 |
| 564.73833224 | 0 |
| 564.85684628 | 0 |
| 564.97536326 | 0 |
| 565.09388317 | 0 |
| 565.21240601 | 0 |
| 565.33093178 | 0 |
| 565.44946049 | 0 |
| 565.56799212 | 0 |
| 565.68652667 | 0 |
| 565.80506415 | 0 |
| 565.92360456 | 0 |
| 566.04214788 | 0 |
| 566.16069413 | 0 |
| 566.27924329 | 0 |
| 566.39779537 | 0 |
| 566.51635037 | 0 |
| 566.63490828 | 0 |
| 566.7534691 | 0 |
| 566.87203283 | 0 |
| 566.99059947 | 0 |
| 567.10916902 | 0 |
| 567.22774148 | 0 |
| 567.34631684 | 0 |
| 567.4648951 | 0 |
| 567.58347626 | 0 |
| 567.70206033 | 0 |
| 567.82064729 | 0 |
| 567.93923715 | 0 |
| 568.0578299 | 0 |
| 568.17642555 | 0 |
| 568.29502409 | 0 |
| 568.41362552 | 0 |
| 568.53222984 | 0 |
| 568.65083705 | 0 |
| 568.76944715 | 0 |
| 568.88806012 | 0 |
| 569.00667599 | 0 |
| 569.12529473 | 0 |
| 569.24391635 | 0 |
| 569.36254085 | 0 |
| 569.48116823 | 0 |
| 569.59979848 | 0 |
| 569.71843161 | 0 |
| 569.83706761 | 0 |
| 569.95570647 | 0 |
| 570.07434821 | 0 |
| 570.19299282 | 0 |
| 570.31164029 | 0 |
| 570.43029063 | 0 |
| 570.54894382 | 0 |
| 570.66759988 | 0 |
| 570.7862588 | 0 |
| 570.90492058 | 0 |
| 571.02358522 | 0 |
| 571.14225271 | 0 |
| 571.26092305 | 0 |
| 571.37959625 | 0 |
| 571.49827229 | 0 |
| 571.61695119 | 0 |
| 571.73563293 | 0 |
| 571.85431752 | 0 |
| 571.97300495 | 0 |
| 572.09169523 | 0 |
| 572.21038834 | 0 |
| 572.3290843 | 0 |
| 572.4477831 | 0 |
| 572.56648473 | 0 |
| 572.68518919 | 0 |
| 572.80389649 | 0 |
| 572.92260663 | 0 |
| 573.04131959 | 0 |
| 573.16003538 | 0 |
| 573.278754 | 0 |
| 573.39747545 | 0 |
| 573.51619972 | 0 |
| 573.63492681 | 0 |
| 573.75365672 | 0 |
| 573.87238945 | 0 |
| 573.99112501 | 0 |
| 574.10986337 | 0 |
| 574.22860456 | 0 |
| 574.34734855 | 0 |
| 574.46609536 | 0 |
| 574.58484498 | 0 |
| 574.70359741 | 0 |
| 574.82235264 | 0 |
| 574.94111068 | 0 |
| 575.05987153 | 0 |
| 575.17863518 | 0 |
| 575.29740162 | 0 |
| 575.41617087 | 0 |
| 575.53494292 | 0 |
| 575.65371776 | 0 |
| 575.7724954 | 0 |
| 575.89127583 | 0 |
| 576.01005906 | 0 |
| 576.12884507 | 0 |
| 576.24763387 | 0 |
| 576.36642546 | 0 |
| 576.48521984 | 0 |
| 576.604017 | 0 |
| 576.72281694 | 0 |
| 576.84161967 | 0 |
| 576.96042517 | 0 |
| 577.07923345 | 0 |
| 577.19804451 | 0 |
| 577.31685834 | 0 |
| 577.43567495 | 0 |
| 577.55449433 | 0 |
| 577.67331648 | 0 |
| 577.7921414 | 0 |
| 577.91096908 | 0 |
| 578.02979953 | 0 |
| 578.14863275 | 0 |
| 578.26746872 | 0 |
| 578.38630746 | 0 |
| 578.50514896 | 0 |
| 578.62399322 | 0 |
| 578.74284023 | 0 |
| 578.86168999 | 0 |
| 578.98054252 | 0 |
| 579.09939779 | 0 |
| 579.21825581 | 0 |
| 579.33711658 | 0 |
| 579.4559801 | 0 |
| 579.57484637 | 0 |
| 579.69371537 | 0 |
| 579.81258712 | 0 |
| 579.93146162 | 0 |
| 580.05033885 | 0 |
| 580.16921882 | 0 |
| 580.28810152 | 0 |
| 580.40698696 | 0 |
| 580.52587514 | 0 |
| 580.64476604 | 0 |
| 580.76365968 | 0 |
| 580.88255605 | 0 |
| 581.00145514 | 0 |
| 581.12035696 | 0 |
| 581.2392615 | 0 |
| 581.35816876 | 0 |
| 581.47707875 | 0 |
| 581.59599145 | 0 |
| 581.71490687 | 0 |
| 581.83382501 | 0 |
| 581.95274587 | 0 |
| 582.07166943 | 0 |
| 582.19059571 | 0 |
| 582.3095247 | 0 |
| 582.4284564 | 0 |
| 582.5473908 | 0 |
| 582.66632791 | 0 |
| 582.78526773 | 0 |
| 582.90421024 | 0 |
| 583.02315546 | 0 |
| 583.14210338 | 0 |
| 583.26105399 | 0 |
| 583.3800073 | 0 |
| 583.49896331 | 0 |
| 583.61792201 | 0 |
| 583.7368834 | 0 |
| 583.85584748 | 0 |
| 583.97481425 | 0 |
| 584.09378371 | 0 |
| 584.21275585 | 0 |
| 584.33173067 | 0 |
| 584.45070818 | 0 |
| 584.56968837 | 0 |
| 584.68867124 | 0 |
| 584.80765679 | 0 |
| 584.92664501 | 0 |
| 585.04563591 | 0 |
| 585.16462948 | 0 |
| 585.28362572 | 0 |
| 585.40262463 | 0 |
| 585.52162621 | 0 |
| 585.64063046 | 0 |
| 585.75963737 | 0 |
| 585.87864695 | 0 |
| 585.99765919 | 0 |
| 586.11667409 | 0 |
| 586.23569165 | 0 |
| 586.35471187 | 0 |
| 586.47373474 | 0 |
| 586.59276027 | 0 |
| 586.71178845 | 0 |
| 586.83081928 | 0 |
| 586.94985277 | 0 |
| 587.0688889 | 0 |
| 587.18792768 | 0 |
| 587.3069691 | 0 |
| 587.42601317 | 0 |
| 587.54505988 | 0 |
| 587.66410923 | 0 |
| 587.78316122 | 0 |
| 587.90221585 | 0 |
| 588.02127311 | 0 |
| 588.14033301 | 0 |
| 588.25939554 | 0 |
| 588.37846071 | 0 |
| 588.4975285 | 0 |
| 588.61659892 | 0 |
| 588.73567197 | 0 |
| 588.85474764 | 0 |
| 588.97382594 | 0 |
| 589.09290686 | 0 |
| 589.2119904 | 0 |
| 589.33107656 | 0 |
| 589.45016534 | 0 |
| 589.56925673 | 0 |
| 589.68835074 | 0 |
| 589.80744736 | 0 |
| 589.92654659 | 0 |
| 590.04564844 | 0 |
| 590.16475289 | 0 |
| 590.28385994 | 0 |
| 590.40296961 | 0 |
| 590.52208187 | 0 |
| 590.64119674 | 0 |
| 590.76031421 | 0 |
| 590.87943428 | 0 |
| 590.99855695 | 0 |
| 591.11768221 | 0 |
| 591.23681007 | 0 |
| 591.35594052 | 0 |
| 591.47507356 | 0 |
| 591.59420919 | 0 |
| 591.71334741 | 0 |
| 591.83248822 | 0 |
| 591.95163161 | 0 |
| 592.07077758 | 0 |
| 592.18992614 | 0 |
| 592.30907728 | 0 |
| 592.428231 | 0 |
| 592.54738729 | 0 |
| 592.66654616 | 0 |
| 592.78570761 | 0 |
| 592.90487163 | 0 |
| 593.02403822 | 0 |
| 593.14320738 | 0 |
| 593.2623791 | 0 |
| 593.3815534 | 0 |
| 593.50073026 | 0 |
| 593.61990968 | 0 |
| 593.73909167 | 0 |
| 593.85827621 | 0 |
| 593.97746332 | 0 |
| 594.09665298 | 0 |
| 594.2158452 | 0 |
| 594.33503997 | 0 |
| 594.4542373 | 0 |
| 594.57343718 | 0 |
| 594.6926396 | 0 |
| 594.81184458 | 0 |
| 594.9310521 | 0 |
| 595.05026217 | 0 |
| 595.16947478 | 0 |
| 595.28868993 | 0 |
| 595.40790762 | 0 |
| 595.52712786 | 0 |
| 595.64635063 | 0 |
| 595.76557593 | 0 |
| 595.88480377 | 0 |
| 596.00403415 | 0 |
| 596.12326705 | 0 |
| 596.24250248 | 0 |
| 596.36174045 | 0 |
| 596.48098093 | 0 |
| 596.60022395 | 0 |
| 596.71946949 | 0 |
| 596.83871754 | 0 |
| 596.95796812 | 0 |
| 597.07722122 | 0 |
| 597.19647684 | 0 |
| 597.31573497 | 0 |
| 597.43499562 | 0 |
| 597.55425878 | 0 |
| 597.67352445 | 0 |
| 597.79279263 | 0 |
| 597.91206332 | 0 |
| 598.03133651 | 0 |
| 598.15061221 | 0 |
| 598.26989041 | 0 |
| 598.38917112 | 0 |
| 598.50845432 | 0 |
| 598.62774003 | 0 |
| 598.74702823 | 0 |
| 598.86631893 | 0 |
| 598.98561212 | 0 |
| 599.10490781 | 0 |
| 599.22420598 | 0 |
| 599.34350665 | 0 |
| 599.4628098 | 0 |
| 599.58211544 | 0 |
| 599.70142357 | 0 |
| 599.82073418 | 0 |
| 599.94004727 | 0 |
| 600.05936284 | 0 |
| 600.17868089 | 0 |
| 600.29800141 | 0 |
| 600.41732442 | 0 |
| 600.53664989 | 0 |
| 600.65597784 | 0 |
| 600.77530826 | 0 |
| 600.89464115 | 0 |
| 601.01397651 | 0 |
| 601.13331434 | 0 |
| 601.25265463 | 0 |
| 601.37199738 | 0 |
| 601.4913426 | 0 |
| 601.61069027 | 0 |
| 601.73004041 | 0 |
| 601.849393 | 0 |
| 601.96874805 | 0 |
| 602.08810555 | 0 |
| 602.2074655 | 0 |
| 602.32682791 | 0 |
| 602.44619276 | 0 |
| 602.56556006 | 0 |
| 602.68492981 | 0 |
| 602.80430201 | 0 |
| 602.92367664 | 0 |
| 603.04305372 | 0 |
| 603.16243324 | 0 |
| 603.2818152 | 0 |
| 603.4011996 | 0 |
| 603.52058643 | 0 |
| 603.63997569 | 0 |
| 603.75936739 | 0 |
| 603.87876152 | 0 |
| 603.99815808 | 0 |
| 604.11755706 | 0 |
| 604.23695848 | 0 |
| 604.35636231 | 0 |
| 604.47576857 | 0 |
| 604.59517726 | 0 |
| 604.71458836 | 0 |
| 604.83400188 | 0 |
| 604.95341782 | 0 |
| 605.07283617 | 0 |
| 605.19225694 | 0 |
| 605.31168012 | 0 |
| 605.43110572 | 0 |
| 605.55053372 | 0 |
| 605.66996413 | 0 |
| 605.78939694 | 0 |
| 605.90883216 | 0 |
| 606.02826979 | 0 |
| 606.14770981 | 0 |
| 606.26715224 | 0 |
| 606.38659706 | 0 |
| 606.50604428 | 0 |
| 606.6254939 | 0 |
| 606.74494591 | 0 |
| 606.86440031 | 0 |
| 606.98385711 | 0 |
| 607.10331629 | 0 |
| 607.22277786 | 0 |
| 607.34224182 | 0 |
| 607.46170816 | 0 |
| 607.58117689 | 0 |
| 607.70064799 | 0 |
| 607.82012148 | 0 |
| 607.93959735 | 0 |
| 608.05907559 | 0 |
| 608.17855621 | 0 |
| 608.2980392 | 0 |
| 608.41752457 | 0 |
| 608.5370123 | 0 |
| 608.65650241 | 0 |
| 608.77599488 | 0 |
| 608.89548972 | 0 |
| 609.01498692 | 0 |
| 609.13448649 | 0 |
| 609.25398842 | 0 |
| 609.37349271 | 0 |
| 609.49299935 | 0 |
| 609.61250836 | 0 |
| 609.73201972 | 0 |
| 609.85153343 | 0 |
| 609.9710495 | 0 |
| 610.09056791 | 0 |
| 610.21008868 | 0 |
| 610.32961179 | 0 |
| 610.44913725 | 0 |
| 610.56866506 | 0 |
| 610.68819521 | 0 |
| 610.8077277 | 0 |
| 610.92726253 | 0 |
| 611.04679969 | 0 |
| 611.1663392 | 0 |
| 611.28588104 | 0 |
| 611.40542521 | 0 |
| 611.52497172 | 0 |
| 611.64452056 | 0 |
| 611.76407172 | 0 |
| 611.88362522 | 0 |
| 612.00318104 | 0 |
| 612.12273918 | 0 |
| 612.24229965 | 0 |
| 612.36186244 | 0 |
| 612.48142755 | 0 |
| 612.60099498 | 0 |
| 612.72056472 | 0 |
| 612.84013678 | 0 |
| 612.95971116 | 0 |
| 613.07928784 | 0 |
| 613.19886684 | 0 |
| 613.31844815 | 0 |
| 613.43803176 | 0 |
| 613.55761768 | 0 |
| 613.6772059 | 0 |
| 613.79679643 | 0 |
| 613.91638926 | 0 |
| 614.03598439 | 0 |
| 614.15558182 | 0 |
| 614.27518154 | 0 |
| 614.39478356 | 0 |
| 614.51438787 | 0 |
| 614.63399448 | 0 |
| 614.75360337 | 0 |
| 614.87321456 | 0 |
| 614.99282803 | 0 |
| 615.11244379 | 0 |
| 615.23206183 | 0 |
| 615.35168216 | 0 |
| 615.47130477 | 0 |
| 615.59092966 | 0 |
| 615.71055682 | 0 |
| 615.83018626 | 0 |
| 615.94981798 | 0 |
| 616.06945197 | 0 |
| 616.18908824 | 0 |
| 616.30872677 | 0 |
| 616.42836758 | 0 |
| 616.54801065 | 0 |
| 616.66765598 | 0 |
| 616.78730358 | 0 |
| 616.90695345 | 0 |
| 617.02660557 | 0 |
| 617.14625996 | 0 |
| 617.2659166 | 0 |
| 617.38557551 | 0 |
| 617.50523666 | 0 |
| 617.62490007 | 0 |
| 617.74456573 | 0 |
| 617.86423364 | 0 |
| 617.98390381 | 0 |
| 618.10357621 | 0 |
| 618.22325087 | 0 |
| 618.34292777 | 0 |
| 618.46260691 | 0 |
| 618.58228829 | 0 |
| 618.70197192 | 0 |
| 618.82165778 | 0 |
| 618.94134588 | 0 |
| 619.06103621 | 0 |
| 619.18072878 | 0 |
| 619.30042357 | 0 |
| 619.4201206 | 0 |
| 619.53981986 | 0 |
| 619.65952135 | 0 |
| 619.77922506 | 0 |
| 619.898931 | 0 |
| 620.01863915 | 0 |
| 620.13834953 | 0 |
| 620.25806213 | 0 |
| 620.37777695 | 0 |
| 620.49749399 | 0 |
| 620.61721324 | 0 |
| 620.7369347 | 0 |
| 620.85665837 | 0 |
| 620.97638426 | 0 |
| 621.09611236 | 0 |
| 621.21584266 | 0 |
| 621.33557517 | 0 |
| 621.45530988 | 0 |
| 621.57504679 | 0 |
| 621.69478591 | 0 |
| 621.81452723 | 0 |
| 621.93427074 | 0 |
| 622.05401645 | 0 |
| 622.17376436 | 0 |
| 622.29351445 | 0 |
| 622.41326675 | 0 |
| 622.53302123 | 0 |
| 622.6527779 | 0 |
| 622.77253676 | 0 |
| 622.8922978 | 0 |
| 623.01206103 | 0 |
| 623.13182644 | 0 |
| 623.25159403 | 0 |
| 623.3713638 | 0 |
| 623.49113575 | 0 |
| 623.61090988 | 0 |
| 623.73068618 | 0 |
| 623.85046465 | 0 |
| 623.9702453 | 0 |
| 624.09002812 | 0 |
| 624.2098131 | 0 |
| 624.32960025 | 0 |
| 624.44938957 | 0 |
| 624.56918106 | 0 |
| 624.6889747 | 0 |
| 624.80877051 | 0 |
| 624.92856847 | 0 |
| 625.0483686 | 0 |
| 625.16817088 | 0 |
| 625.28797531 | 0 |
| 625.4077819 | 0 |
| 625.52759064 | 0 |
| 625.64740154 | 0 |
| 625.76721458 | 0 |
| 625.88702976 | 0 |
| 626.0068471 | 0 |
| 626.12666657 | 0 |
| 626.24648819 | 0 |
| 626.36631195 | 0 |
| 626.48613785 | 0 |
| 626.60596589 | 0 |
| 626.72579607 | 0 |
| 626.84562838 | 0 |
| 626.96546282 | 0 |
| 627.0852994 | 0 |
| 627.2051381 | 0 |
| 627.32497893 | 0 |
| 627.4448219 | 0 |
| 627.56466698 | 0 |
| 627.68451419 | 0 |
| 627.80436353 | 0 |
| 627.92421498 | 0 |
| 628.04406855 | 0 |
| 628.16392425 | 0 |
| 628.28378205 | 0 |
| 628.40364198 | 0 |
| 628.52350401 | 0 |
| 628.64336816 | 0 |
| 628.76323442 | 0 |
| 628.88310279 | 0 |
| 629.00297326 | 0 |
| 629.12284584 | 0 |
| 629.24272053 | 0 |
| 629.36259731 | 0 |
| 629.4824762 | 0 |
| 629.60235719 | 0 |
| 629.72224027 | 0 |
| 629.84212545 | 0 |
| 629.96201273 | 0 |
| 630.0819021 | 0 |
| 630.20179356 | 0 |
| 630.32168711 | 0 |
| 630.44158275 | 0 |
| 630.56148047 | 0 |
| 630.68138029 | 0 |
| 630.80128218 | 0 |
| 630.92118616 | 0 |
| 631.04109222 | 0 |
| 631.16100036 | 0 |
| 631.28091058 | 0 |
| 631.40082287 | 0 |
| 631.52073724 | 0 |
| 631.64065368 | 0 |
| 631.76057219 | 0 |
| 631.88049277 | 0 |
| 632.00041543 | 0 |
| 632.12034014 | 0 |
| 632.24026693 | 0 |
| 632.36019578 | 0 |
| 632.48012669 | 0 |
| 632.60005966 | 0 |
| 632.71999469 | 0 |
| 632.83993178 | 0 |
| 632.95987092 | 0 |
| 633.07981212 | 0 |
| 633.19975537 | 0 |
| 633.31970068 | 0 |
| 633.43964803 | 0 |
| 633.55959743 | 0 |
| 633.67954888 | 0 |
| 633.79950238 | 0 |
| 633.91945792 | 0 |
| 634.0394155 | 0 |
| 634.15937512 | 0 |
| 634.27933678 | 0 |
| 634.39930048 | 0 |
| 634.51926622 | 0 |
| 634.63923399 | 0 |
| 634.75920379 | 0 |
| 634.87917562 | 0 |
| 634.99914949 | 0 |
| 635.11912538 | 0 |
| 635.2391033 | 0 |
| 635.35908325 | 0 |
| 635.47906522 | 0 |
| 635.59904921 | 0 |
| 635.71903522 | 0 |
| 635.83902325 | 0 |
| 635.9590133 | 0 |
| 636.07900537 | 0 |
| 636.19899945 | 0 |
| 636.31899554 | 0 |
| 636.43899365 | 0 |
| 636.55899376 | 0 |
| 636.67899588 | 0 |
| 636.79900001 | 0 |
| 636.91900615 | 0 |
| 637.03901429 | 0 |
| 637.15902443 | 0 |
| 637.27903657 | 0 |
| 637.39905071 | 0 |
| 637.51906685 | 0 |
| 637.63908499 | 0 |
| 637.75910512 | 0 |
| 637.87912724 | 0 |
| 637.99915135 | 0 |
| 638.11917746 | 0 |
| 638.23920555 | 0 |
| 638.35923563 | 0 |
| 638.47926769 | 0 |
| 638.59930174 | 0 |
| 638.71933777 | 0 |
| 638.83937578 | 0 |
| 638.95941577 | 0 |
| 639.07945774 | 0 |
| 639.19950169 | 0 |
| 639.3195476 | 0 |
| 639.4395955 | 0 |
| 639.55964536 | 0 |
| 639.67969719 | 0 |
| 639.79975099 | 0 |
| 639.91980676 | 0 |
| 640.03986449 | 0 |
| 640.15992419 | 0 |
| 640.27998585 | 0 |
| 640.40004947 | 0 |
| 640.52011505 | 0 |
| 640.64018258 | 0 |
| 640.76025207 | 0 |
| 640.88032352 | 0 |
| 641.00039692 | 0 |
| 641.12047227 | 0 |
| 641.24054957 | 0 |
| 641.36062882 | 0 |
| 641.48071002 | 0 |
| 641.60079316 | 0 |
| 641.72087824 | 0 |
| 641.84096527 | 0 |
| 641.96105424 | 0 |
| 642.08114514 | 0 |
| 642.20123799 | 0 |
| 642.32133276 | 0 |
| 642.44142948 | 0 |
| 642.56152813 | 0 |
| 642.6816287 | 0 |
| 642.80173121 | 0 |
| 642.92183565 | 0 |
| 643.04194201 | 0 |
| 643.1620503 | 0 |
| 643.28216051 | 0 |
| 643.40227264 | 0 |
| 643.5223867 | 0 |
| 643.64250267 | 0 |
| 643.76262056 | 0 |
| 643.88274037 | 0 |
| 644.00286209 | 0 |
| 644.12298572 | 0 |
| 644.24311127 | 0 |
| 644.36323872 | 0 |
| 644.48336809 | 0 |
| 644.60349936 | 0 |
| 644.72363253 | 0 |
| 644.84376761 | 0 |
| 644.96390459 | 0 |
| 645.08404347 | 0 |
| 645.20418425 | 0 |
| 645.32432693 | 0 |
| 645.4444715 | 0 |
| 645.56461797 | 0 |
| 645.68476633 | 0 |
| 645.80491658 | 0 |
| 645.92506872 | 0 |
| 646.04522275 | 0 |
| 646.16537866 | 0 |
| 646.28553646 | 0 |
| 646.40569615 | 0 |
| 646.52585771 | 0 |
| 646.64602116 | 0 |
| 646.76618648 | 0 |
| 646.88635369 | 0 |
| 647.00652276 | 0 |
| 647.12669372 | 0 |
| 647.24686654 | 0 |
| 647.36704124 | 0 |
| 647.48721781 | 0 |
| 647.60739624 | 0 |
| 647.72757654 | 0 |
| 647.84775871 | 0 |
| 647.96794274 | 0 |
| 648.08812863 | 0 |
| 648.20831638 | 0 |
| 648.32850599 | 0 |
| 648.44869746 | 0 |
| 648.56889078 | 0 |
| 648.68908596 | 0 |
| 648.80928299 | 0 |
| 648.92948187 | 0 |
| 649.0496826 | 0 |
| 649.16988518 | 0 |
| 649.2900896 | 0 |
| 649.41029587 | 0 |
| 649.53050399 | 0 |
| 649.65071394 | 0 |
| 649.77092574 | 0 |
| 649.89113937 | 0 |
| 650.01135485 | 0 |
| 650.13157215 | 0 |
| 650.2517913 | 0 |
| 650.37201227 | 0 |
| 650.49223507 | 0 |
| 650.61245971 | 0 |
| 650.73268617 | 0 |
| 650.85291446 | 0 |
| 650.97314458 | 0 |
| 651.09337651 | 0 |
| 651.21361027 | 0 |
| 651.33384585 | 0 |
| 651.45408325 | 0 |
| 651.57432247 | 0 |
| 651.6945635 | 0 |
| 651.81480634 | 0 |
| 651.935051 | 0 |
| 652.05529747 | 0 |
| 652.17554575 | 0 |
| 652.29579584 | 0 |
| 652.41604773 | 0 |
| 652.53630143 | 0 |
| 652.65655693 | 0 |
| 652.77681423 | 0 |
| 652.89707333 | 0 |
| 653.01733423 | 0 |
| 653.13759693 | 0 |
| 653.25786143 | 0 |
| 653.37812772 | 0 |
| 653.4983958 | 0 |
| 653.61866567 | 0 |
| 653.73893733 | 0 |
| 653.85921078 | 0 |
| 653.97948601 | 0 |
| 654.09976303 | 0 |
| 654.22004184 | 0 |
| 654.34032242 | 0 |
| 654.46060479 | 0 |
| 654.58088893 | 0 |
| 654.70117485 | 0 |
| 654.82146255 | 0 |
| 654.94175202 | 0 |
| 655.06204326 | 0 |
| 655.18233628 | 0 |
| 655.30263106 | 0 |
| 655.42292761 | 0 |
| 655.54322593 | 0 |
| 655.66352601 | 0 |
| 655.78382786 | 0 |
| 655.90413146 | 0 |
| 656.02443683 | 0 |
| 656.14474396 | 0 |
| 656.26505284 | 0 |
| 656.38536348 | 0 |
| 656.50567587 | 0 |
| 656.62599001 | 0 |
| 656.74630591 | 0 |
| 656.86662356 | 0 |
| 656.98694295 | 0 |
| 657.10726409 | 0 |
| 657.22758697 | 0 |
| 657.3479116 | 0 |
| 657.46823797 | 0 |
| 657.58856607 | 0 |
| 657.70889592 | 0 |
| 657.8292275 | 0 |
| 657.94956082 | 0 |
| 658.06989588 | 0 |
| 658.19023266 | 0 |
| 658.31057118 | 0 |
| 658.43091142 | 0 |
| 658.5512534 | 0 |
| 658.6715971 | 0 |
| 658.79194252 | 0 |
| 658.91228967 | 0 |
| 659.03263854 | 0 |
| 659.15298913 | 0 |
| 659.27334143 | 0 |
| 659.39369546 | 0 |
| 659.5140512 | 0 |
| 659.63440865 | 0 |
| 659.75476782 | 0 |
| 659.87512869 | 0 |
| 659.99549128 | 0 |
| 660.11585557 | 0 |
| 660.23622157 | 0 |
| 660.35658928 | 0 |
| 660.47695869 | 0 |
| 660.59732979 | 0 |
| 660.7177026 | 0 |
| 660.83807711 | 0 |
| 660.95845331 | 0 |
| 661.07883121 | 0 |
| 661.19921081 | 0 |
| 661.31959209 | 0 |
| 661.43997507 | 0 |
| 661.56035973 | 0 |
| 661.68074609 | 0 |
| 661.80113413 | 0 |
| 661.92152385 | 0 |
| 662.04191526 | 0 |
| 662.16230834 | 0 |
| 662.28270311 | 0 |
| 662.40309956 | 0 |
| 662.52349768 | 0 |
| 662.64389748 | 0 |
| 662.76429895 | 0 |
| 662.8847021 | 0 |
| 663.00510691 | 0 |
| 663.1255134 | 0 |
| 663.24592155 | 0 |
| 663.36633137 | 0 |
| 663.48674285 | 0 |
| 663.60715599 | 0 |
| 663.7275708 | 0 |
| 663.84798727 | 0 |
| 663.96840539 | 0 |
| 664.08882517 | 0 |
| 664.20924661 | 0 |
| 664.3296697 | 0 |
| 664.45009445 | 0 |
| 664.57052084 | 0 |
| 664.69094888 | 0 |
| 664.81137857 | 0 |
| 664.93180991 | 0 |
| 665.05224289 | 0 |
| 665.17267751 | 0 |
| 665.29311378 | 0 |
| 665.41355168 | 0 |
| 665.53399122 | 0 |
| 665.6544324 | 0 |
| 665.77487522 | 0 |
| 665.89531967 | 0 |
| 666.01576575 | 0 |
| 666.13621346 | 0 |
| 666.2566628 | 0 |
| 666.37711377 | 0 |
| 666.49756636 | 0 |
| 666.61802058 | 0 |
| 666.73847642 | 0 |
| 666.85893388 | 0 |
| 666.97939296 | 0 |
| 667.09985366 | 0 |
| 667.22031598 | 0 |
| 667.34077991 | 0 |
| 667.46124546 | 0 |
| 667.58171261 | 0 |
| 667.70218138 | 0 |
| 667.82265176 | 0 |
| 667.94312374 | 0 |
| 668.06359733 | 0 |
| 668.18407253 | 0 |
| 668.30454933 | 0 |
| 668.42502772 | 0 |
| 668.54550772 | 0 |
| 668.66598932 | 0 |
| 668.78647251 | 0 |
| 668.9069573 | 0 |
| 669.02744368 | 0 |
| 669.14793166 | 0 |
| 669.26842122 | 0 |
| 669.38891237 | 0 |
| 669.50940511 | 0 |
| 669.62989944 | 0 |
| 669.75039535 | 0 |
| 669.87089285 | 0 |
| 669.99139192 | 0 |
| 670.11189257 | 0 |
| 670.23239481 | 0 |
| 670.35289862 | 0 |
| 670.473404 | 0 |
| 670.59391096 | 0 |
| 670.71441949 | 0 |
| 670.83492959 | 0 |
| 670.95544126 | 0 |
| 671.07595449 | 0 |
| 671.1964693 | 0 |
| 671.31698566 | 0 |
| 671.43750359 | 0 |
| 671.55802308 | 0 |
| 671.67854413 | 0 |
| 671.79906674 | 0 |
| 671.9195909 | 0 |
| 672.04011662 | 0 |
| 672.1606439 | 0 |
| 672.28117272 | 0 |
| 672.40170309 | 0 |
| 672.52223502 | 0 |
| 672.64276849 | 0 |
| 672.76330351 | 0 |
| 672.88384007 | 0 |
| 673.00437817 | 0 |
| 673.12491782 | 0 |
| 673.245459 | 0 |
| 673.36600172 | 0 |
| 673.48654598 | 0 |
| 673.60709178 | 0 |
| 673.7276391 | 0 |
| 673.84818796 | 0 |
| 673.96873835 | 0 |
| 674.08929027 | 0 |
| 674.20984372 | 0 |
| 674.33039869 | 0 |
| 674.45095518 | 0 |
| 674.5715132 | 0 |
| 674.69207274 | 0 |
| 674.8126338 | 0 |
| 674.93319637 | 0 |
| 675.05376047 | 0 |
| 675.17432607 | 0 |
| 675.2948932 | 0 |
| 675.41546183 | 0 |
| 675.53603197 | 0 |
| 675.65660362 | 0 |
| 675.77717678 | 0 |
| 675.89775145 | 0 |
| 676.01832762 | 0 |
| 676.13890529 | 0 |
| 676.25948446 | 0 |
| 676.38006513 | 0 |
| 676.5006473 | 0 |
| 676.62123097 | 0 |
| 676.74181613 | 0 |
| 676.86240278 | 0 |
| 676.98299093 | 0 |
| 677.10358057 | 0 |
| 677.22417169 | 0 |
| 677.3447643 | 0 |
| 677.4653584 | 0 |
| 677.58595398 | 0 |
| 677.70655105 | 0 |
| 677.82714959 | 0 |
| 677.94774962 | 0 |
| 678.06835112 | 0 |
| 678.1889541 | 0 |
| 678.30955855 | 0 |
| 678.43016448 | 0 |
| 678.55077188 | 0 |
| 678.67138074 | 0 |
| 678.79199108 | 0 |
| 678.91260289 | 0 |
| 679.03321616 | 0 |
| 679.15383089 | 0 |
| 679.27444709 | 0 |
| 679.39506474 | 0 |
| 679.51568386 | 0 |
| 679.63630443 | 0 |
| 679.75692647 | 0 |
| 679.87754995 | 0 |
| 679.99817489 | 0 |
| 680.11880128 | 0 |
| 680.23942912 | 0 |
| 680.36005841 | 0 |
| 680.48068915 | 0 |
| 680.60132133 | 0 |
| 680.72195495 | 0 |
| 680.84259002 | 0 |
| 680.96322653 | 0 |
| 681.08386448 | 0 |
| 681.20450386 | 0 |
| 681.32514469 | 0 |
| 681.44578694 | 0 |
| 681.56643063 | 0 |
| 681.68707575 | 0 |
| 681.8077223 | 0 |
| 681.92837028 | 0 |
| 682.04901969 | 0 |
| 682.16967052 | 0 |
| 682.29032278 | 0 |
| 682.41097646 | 0 |
| 682.53163156 | 0 |
| 682.65228808 | 0 |
| 682.77294601 | 0 |
| 682.89360537 | 0 |
| 683.01426613 | 0 |
| 683.13492832 | 0 |
| 683.25559191 | 0 |
| 683.37625691 | 0 |
| 683.49692332 | 0 |
| 683.61759114 | 0 |
| 683.73826036 | 0 |
| 683.85893099 | 0 |
| 683.97960302 | 0 |
| 684.10027645 | 0 |
| 684.22095127 | 0 |
| 684.3416275 | 0 |
| 684.46230512 | 0 |
| 684.58298414 | 0 |
| 684.70366455 | 0 |
| 684.82434635 | 0 |
| 684.94502954 | 0 |
| 685.06571413 | 0 |
| 685.18640009 | 0 |
| 685.30708744 | 0 |
| 685.42777618 | 0 |
| 685.5484663 | 0 |
| 685.6691578 | 0 |
| 685.78985068 | 0 |
| 685.91054493 | 0 |
| 686.03124057 | 0 |
| 686.15193757 | 0 |
| 686.27263595 | 0 |
| 686.3933357 | 0 |
| 686.51403682 | 0 |
| 686.63473931 | 0 |
| 686.75544317 | 0 |
| 686.87614839 | 0 |
| 686.99685498 | 0 |
| 687.11756292 | 0 |
| 687.23827223 | 0 |
| 687.3589829 | 0 |
| 687.47969492 | 0 |
| 687.6004083 | 0 |
| 687.72112304 | 0 |
| 687.84183913 | 0 |
| 687.96255657 | 0 |
| 688.08327536 | 0 |
| 688.2039955 | 0 |
| 688.32471698 | 0 |
| 688.44543981 | 0 |
| 688.56616398 | 0 |
| 688.6868895 | 0 |
| 688.80761636 | 0 |
| 688.92834455 | 0 |
| 689.04907408 | 0 |
| 689.16980495 | 0 |
| 689.29053716 | 0 |
| 689.41127069 | 0 |
| 689.53200556 | 0 |
| 689.65274176 | 0 |
| 689.77347928 | 0 |
| 689.89421813 | 0 |
| 690.01495831 | 0 |
| 690.13569981 | 0 |
| 690.25644264 | 0 |
| 690.37718678 | 0 |
| 690.49793224 | 0 |
| 690.61867902 | 0 |
| 690.73942712 | 0 |
| 690.86017653 | 0 |
| 690.98092725 | 0 |
| 691.10167929 | 0 |
| 691.22243263 | 0 |
| 691.34318729 | 0 |
| 691.46394325 | 0 |
| 691.58470051 | 0 |
| 691.70545908 | 0 |
| 691.82621895 | 0 |
| 691.94698012 | 0 |
| 692.06774259 | 0 |
| 692.18850636 | 0 |
| 692.30927142 | 0 |
| 692.43003778 | 0 |
| 692.55080543 | 0 |
| 692.67157437 | 0 |
| 692.7923446 | 0 |
| 692.91311612 | 0 |
| 693.03388893 | 0 |
| 693.15466302 | 0 |
| 693.27543839 | 0 |
| 693.39621505 | 0 |
| 693.51699298 | 0 |
| 693.6377722 | 0 |
| 693.75855269 | 0 |
| 693.87933446 | 0 |
| 694.00011751 | 0 |
| 694.12090182 | 0 |
| 694.24168741 | 0 |
| 694.36247427 | 0 |
| 694.48326239 | 0 |
| 694.60405178 | 0 |
| 694.72484244 | 0 |
| 694.84563436 | 0 |
| 694.96642754 | 0 |
| 695.08722199 | 0 |
| 695.20801769 | 0 |
| 695.32881465 | 0 |
| 695.44961286 | 0 |
| 695.57041233 | 0 |
| 695.69121305 | 0 |
| 695.81201502 | 0 |
| 695.93281825 | 0 |
| 696.05362272 | 0 |
| 696.17442843 | 0 |
| 696.2952354 | 0 |
| 696.4160436 | 0 |
| 696.53685305 | 0 |
| 696.65766374 | 0 |
| 696.77847566 | 0 |
| 696.89928883 | 0 |
| 697.02010323 | 0 |
| 697.14091886 | 0 |
| 697.26173573 | 0 |
| 697.38255382 | 0 |
| 697.50337315 | 0 |
| 697.6241937 | 0 |
| 697.74501549 | 0 |
| 697.86583849 | 0 |
| 697.98666272 | 0 |
| 698.10748817 | 0 |
| 698.22831485 | 0 |
| 698.34914274 | 0 |
| 698.46997184 | 0 |
| 698.59080217 | 0 |
| 698.71163371 | 0 |
| 698.83246646 | 0 |
| 698.95330042 | 0 |
| 699.07413559 | 0 |
| 699.19497197 | 0 |
| 699.31580955 | 0 |
| 699.43664834 | 0 |
| 699.55748834 | 0 |
| 699.67832953 | 0 |
| 699.79917193 | 0 |
| 699.92001552 | 0 |
| 700.04086031 | 0 |
| 700.1617063 | 0 |
| 700.28255348 | 0 |
| 700.40340185 | 0 |
| 700.52425142 | 0 |
| 700.64510217 | 0 |
| 700.76595412 | 0 |
| 700.88680724 | 0 |
| 701.00766156 | 0 |
| 701.12851705 | 0 |
| 701.24937373 | 0 |
| 701.37023159 | 0 |
| 701.49109063 | 0 |
| 701.61195084 | 0 |
| 701.73281223 | 0 |
| 701.8536748 | 0 |
| 701.97453853 | 0 |
| 702.09540344 | 0 |
| 702.21626952 | 0 |
| 702.33713676 | 0 |
| 702.45800517 | 0 |
| 702.57887475 | 0 |
| 702.69974549 | 0 |
| 702.82061739 | 0 |
| 702.94149045 | 0 |
| 703.06236467 | 0 |
| 703.18324005 | 0 |
| 703.30411658 | 0 |
| 703.42499426 | 0 |
| 703.5458731 | 0 |
| 703.66675309 | 0 |
| 703.78763423 | 0 |
| 703.90851652 | 0 |
| 704.02939995 | 0 |
| 704.15028453 | 0 |
| 704.27117025 | 0 |
| 704.39205711 | 0 |
| 704.51294511 | 0 |
| 704.63383425 | 0 |
| 704.75472453 | 0 |
| 704.87561595 | 0 |
| 704.99650849 | 0 |
| 705.11740217 | 0 |
| 705.23829698 | 0 |
| 705.35919293 | 0 |
| 705.48008999 | 0 |
| 705.60098819 | 0 |
| 705.72188751 | 0 |
| 705.84278795 | 0 |
| 705.96368951 | 0 |
| 706.0845922 | 0 |
| 706.205496 | 0 |
| 706.32640092 | 0 |
| 706.44730695 | 0 |
| 706.5682141 | 0 |
| 706.68912236 | 0 |
| 706.81003173 | 0 |
| 706.93094221 | 0 |
| 707.0518538 | 0 |
| 707.1727665 | 0 |
| 707.2936803 | 0 |
| 707.4145952 | 0 |
| 707.5355112 | 0 |
| 707.65642831 | 0 |
| 707.77734651 | 0 |
| 707.89826581 | 0 |
| 708.0191862 | 0 |
| 708.14010769 | 0 |
| 708.26103027 | 0 |
| 708.38195394 | 0 |
| 708.50287871 | 0 |
| 708.62380455 | 0 |
| 708.74473149 | 0 |
| 708.86565951 | 0 |
| 708.98658861 | 0 |
| 709.10751879 | 0 |
| 709.22845006 | 0 |
| 709.3493824 | 0 |
| 709.47031582 | 0 |
| 709.59125031 | 0 |
| 709.71218588 | 0 |
| 709.83312252 | 0 |
| 709.95406023 | 0 |
| 710.07499901 | 0 |
| 710.19593886 | 0 |
| 710.31687978 | 0 |
| 710.43782175 | 0 |
| 710.5587648 | 0 |
| 710.6797089 | 0 |
| 710.80065406 | 0 |
| 710.92160028 | 0 |
| 711.04254756 | 0 |
| 711.16349589 | 0 |
| 711.28444528 | 0 |
| 711.40539572 | 0 |
| 711.52634721 | 0 |
| 711.64729975 | 0 |
| 711.76825334 | 0 |
| 711.88920797 | 0 |
| 712.01016365 | 0 |
| 712.13112037 | 0 |
| 712.25207813 | 0 |
| 712.37303693 | 0 |
| 712.49399677 | 0 |
| 712.61495764 | 0 |
| 712.73591956 | 0 |
| 712.8568825 | 0 |
| 712.97784648 | 0 |
| 713.09881149 | 0 |
| 713.21977752 | 0 |
| 713.34074459 | 0 |
| 713.46171268 | 0 |
| 713.58268179 | 0 |
| 713.70365193 | 0 |
| 713.82462309 | 0 |
| 713.94559527 | 0 |
| 714.06656847 | 0 |
| 714.18754268 | 0 |
| 714.30851791 | 0 |
| 714.42949415 | 0 |
| 714.55047141 | 0 |
| 714.67144968 | 0 |
| 714.79242895 | 0 |
| 714.91340923 | 0 |
| 715.03439052 | 0 |
| 715.15537281 | 0 |
| 715.27635611 | 0 |
| 715.3973404 | 0 |
| 715.5183257 | 0 |
| 715.63931199 | 0 |
| 715.76029929 | 0 |
| 715.88128757 | 0 |
| 716.00227685 | 0 |
| 716.12326712 | 0 |
| 716.24425839 | 0 |
| 716.36525064 | 0 |
| 716.48624388 | 0 |
| 716.6072381 | 0 |
| 716.72823331 | 0 |
| 716.8492295 | 0 |
| 716.97022668 | 0 |
| 717.09122483 | 0 |
| 717.21222396 | 0 |
| 717.33322407 | 0 |
| 717.45422515 | 0 |
| 717.57522721 | 0 |
| 717.69623023 | 0 |
| 717.81723423 | 0 |
| 717.9382392 | 0 |
| 718.05924513 | 0 |
| 718.18025204 | 0 |
| 718.3012599 | 0 |
| 718.42226873 | 0 |
| 718.54327852 | 0 |
| 718.66428927 | 0 |
| 718.78530097 | 0 |
| 718.90631364 | 0 |
| 719.02732725 | 0 |
| 719.14834183 | 0 |
| 719.26935735 | 0 |
| 719.39037382 | 0 |
| 719.51139125 | 0 |
| 719.63240962 | 0 |
| 719.75342893 | 0 |
| 719.87444919 | 0 |
| 719.9954704 | 0 |
| 720.11649254 | 0 |
| 720.23751562 | 0 |
| 720.35853965 | 0 |
| 720.4795646 | 0 |
| 720.6005905 | 0 |
| 720.72161732 | 0 |
| 720.84264508 | 0 |
| 720.96367377 | 0 |
| 721.08470339 | 0 |
| 721.20573393 | 0 |
| 721.32676541 | 0 |
| 721.4477978 | 0 |
| 721.56883112 | 0 |
| 721.68986536 | 0 |
| 721.81090052 | 0 |
| 721.93193659 | 0 |
| 722.05297358 | 0 |
| 722.17401149 | 0 |
| 722.29505031 | 0 |
| 722.41609005 | 0 |
| 722.53713069 | 0 |
| 722.65817224 | 0 |
| 722.7792147 | 0 |
| 722.90025807 | 0 |
| 723.02130233 | 0 |
| 723.14234751 | 0 |
| 723.26339358 | 0 |
| 723.38444055 | 0 |
| 723.50548842 | 0 |
| 723.62653719 | 0 |
| 723.74758685 | 0 |
| 723.8686374 | 0 |
| 723.98968885 | 0 |
| 724.11074119 | 0 |
| 724.23179441 | 0 |
| 724.35284853 | 0 |
| 724.47390352 | 0 |
| 724.59495941 | 0 |
| 724.71601617 | 0 |
| 724.83707382 | 0 |
| 724.95813234 | 0 |
| 725.07919175 | 0 |
| 725.20025203 | 0 |
| 725.32131318 | 0 |
| 725.44237521 | 0 |
| 725.56343811 | 0 |
| 725.68450188 | 0 |
| 725.80556652 | 0 |
| 725.92663202 | 0 |
| 726.04769839 | 0 |
| 726.16876563 | 0 |
| 726.28983373 | 0 |
| 726.41090268 | 0 |
| 726.5319725 | 0 |
| 726.65304318 | 0 |
| 726.77411471 | 0 |
| 726.8951871 | 0 |
| 727.01626034 | 0 |
| 727.13733443 | 0 |
| 727.25840937 | 0 |
| 727.37948516 | 0 |
| 727.5005618 | 0 |
| 727.62163928 | 0 |
| 727.74271761 | 0 |
| 727.86379678 | 0 |
| 727.98487679 | 0 |
| 728.10595764 | 0 |
| 728.22703933 | 0 |
| 728.34812185 | 0 |
| 728.46920521 | 0 |
| 728.5902894 | 0 |
| 728.71137443 | 0 |
| 728.83246028 | 0 |
| 728.95354696 | 0 |
| 729.07463447 | 0 |
| 729.19572281 | 0 |
| 729.31681196 | 0 |
| 729.43790195 | 0 |
| 729.55899275 | 0 |
| 729.68008437 | 0 |
| 729.80117681 | 0 |
| 729.92227006 | 0 |
| 730.04336413 | 0 |
| 730.16445902 | 0 |
| 730.28555471 | 0 |
| 730.40665121 | 0 |
| 730.52774853 | 0 |
| 730.64884665 | 0 |
| 730.76994557 | 0 |
| 730.8910453 | 0 |
| 731.01214583 | 0 |
| 731.13324717 | 0 |
| 731.2543493 | 0 |
| 731.37545223 | 0 |
| 731.49655595 | 0 |
| 731.61766047 | 0 |
| 731.73876579 | 0 |
| 731.85987189 | 0 |
| 731.98097879 | 0 |
| 732.10208647 | 0 |
| 732.22319494 | 0 |
| 732.3443042 | 0 |
| 732.46541424 | 0 |
| 732.58652506 | 0 |
| 732.70763666 | 0 |
| 732.82874904 | 0 |
| 732.9498622 | 0 |
| 733.07097614 | 0 |
| 733.19209085 | 0 |
| 733.31320633 | 0 |
| 733.43432259 | 0 |
| 733.55543961 | 0 |
| 733.6765574 | 0 |
| 733.79767596 | 0 |
| 733.91879529 | 0 |
| 734.03991538 | 0 |
| 734.16103623 | 0 |
| 734.28215784 | 0 |
| 734.40328021 | 0 |
| 734.52440334 | 0 |
| 734.64552723 | 0 |
| 734.76665187 | 0 |
| 734.88777726 | 0 |
| 735.0089034 | 0 |
| 735.1300303 | 0 |
| 735.25115794 | 0 |
| 735.37228633 | 0 |
| 735.49341546 | 0 |
| 735.61454534 | 0 |
| 735.73567596 | 0 |
| 735.85680732 | 0 |
| 735.97793942 | 0 |
| 736.09907226 | 0 |
| 736.22020583 | 0 |
| 736.34134014 | 0 |
| 736.46247518 | 0 |
| 736.58361095 | 0 |
| 736.70474745 | 0 |
| 736.82588468 | 0 |
| 736.94702264 | 0 |
| 737.06816132 | 0 |
| 737.18930073 | 0 |
| 737.31044086 | 0 |
| 737.43158171 | 0 |
| 737.55272327 | 0 |
| 737.67386556 | 0 |
| 737.79500856 | 0 |
| 737.91615228 | 0 |
| 738.0372967 | 0 |
| 738.15844184 | 0 |
| 738.27958769 | 0 |
| 738.40073425 | 0 |
| 738.52188152 | 0 |
| 738.64302949 | 0 |
| 738.76417816 | 0 |
| 738.88532754 | 0 |
| 739.00647761 | 0 |
| 739.12762839 | 0 |
| 739.24877986 | 0 |
| 739.36993203 | 0 |
| 739.49108489 | 0 |
| 739.61223845 | 0 |
| 739.73339269 | 0 |
| 739.85454763 | 0 |
| 739.97570326 | 0 |
| 740.09685957 | 0 |
| 740.21801656 | 0 |
| 740.33917425 | 0 |
| 740.46033261 | 0 |
| 740.58149165 | 0 |
| 740.70265137 | 0 |
| 740.82381177 | 0 |
| 740.94497285 | 0 |
| 741.0661346 | 0 |
| 741.18729702 | 0 |
| 741.30846011 | 0 |
| 741.42962388 | 0 |
| 741.55078831 | 0 |
| 741.6719534 | 0 |
| 741.79311917 | 0 |
| 741.91428559 | 0 |
| 742.03545268 | 0 |
| 742.15662043 | 0 |
| 742.27778884 | 0 |
| 742.39895791 | 0 |
| 742.52012763 | 0 |
| 742.641298 | 0 |
| 742.76246903 | 0 |
| 742.88364071 | 0 |
| 743.00481304 | 0 |
| 743.12598602 | 0 |
| 743.24715964 | 0 |
| 743.36833391 | 0 |
| 743.48950882 | 0 |
| 743.61068437 | 0 |
| 743.73186057 | 0 |
| 743.8530374 | 0 |
| 743.97421487 | 0 |
| 744.09539298 | 0 |
| 744.21657172 | 0 |
| 744.33775109 | 0 |
| 744.4589311 | 0 |
| 744.58011173 | 0 |
| 744.70129299 | 0 |
| 744.82247488 | 0 |
| 744.9436574 | 0 |
| 745.06484053 | 0 |
| 745.18602429 | 0 |
| 745.30720867 | 0 |
| 745.42839367 | 0 |
| 745.54957929 | 0 |